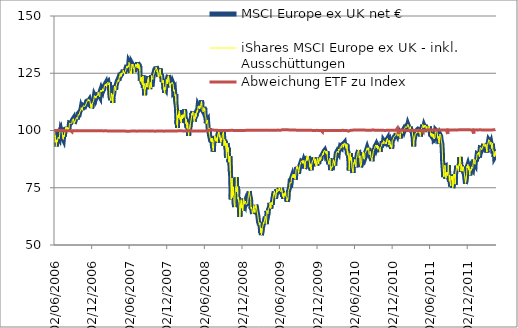
| Category | MSCI Europe ex UK net € | iShares MSCI Europe ex UK - inkl. Ausschüttungen | Abweichung ETF zu Index |
|---|---|---|---|
| 02/06/2006 | 100 | 100 | 100 |
| 05/06/2006 | 99.412 | 99.411 | 100 |
| 06/06/2006 | 97.257 | 97.28 | 100.024 |
| 07/06/2006 | 97.73 | 97.733 | 100.003 |
| 08/06/2006 | 94.902 | 94.9 | 99.998 |
| 09/06/2006 | 96.413 | 96.423 | 100.01 |
| 12/06/2006 | 95.338 | 95.353 | 100.016 |
| 13/06/2006 | 93.068 | 93.094 | 100.028 |
| 14/06/2006 | 93.34 | 93.366 | 100.028 |
| 15/06/2006 | 95.714 | 95.713 | 100 |
| 16/06/2006 | 94.985 | 95.008 | 100.025 |
| 19/06/2006 | 95.79 | 95.854 | 100.067 |
| 20/06/2006 | 96.29 | 96.294 | 100.005 |
| 21/06/2006 | 96.523 | 96.536 | 100.014 |
| 22/06/2006 | 97.085 | 97.097 | 100.013 |
| 23/06/2006 | 97.28 | 97.291 | 100.012 |
| 26/06/2006 | 97.078 | 97.096 | 100.018 |
| 27/06/2006 | 96.367 | 96.387 | 100.021 |
| 28/06/2006 | 96.334 | 96.35 | 100.017 |
| 29/06/2006 | 98.132 | 98.143 | 100.011 |
| 30/06/2006 | 99.799 | 99.799 | 99.999 |
| 03/07/2006 | 100.395 | 100.377 | 99.983 |
| 04/07/2006 | 100.609 | 100.595 | 99.987 |
| 05/07/2006 | 99.355 | 99.334 | 99.979 |
| 06/07/2006 | 100.236 | 100.241 | 100.005 |
| 07/07/2006 | 99.886 | 99.877 | 99.992 |
| 10/07/2006 | 100.283 | 100.241 | 99.958 |
| 11/07/2006 | 99.255 | 99.233 | 99.978 |
| 12/07/2006 | 99.654 | 99.637 | 99.983 |
| 13/07/2006 | 98.024 | 98.008 | 99.983 |
| 14/07/2006 | 96.695 | 96.677 | 99.981 |
| 17/07/2006 | 96.121 | 96.103 | 99.982 |
| 18/07/2006 | 95.728 | 95.667 | 99.936 |
| 19/07/2006 | 98.02 | 97.97 | 99.949 |
| 20/07/2006 | 98.397 | 98.342 | 99.944 |
| 21/07/2006 | 97.405 | 97.369 | 99.963 |
| 24/07/2006 | 99.178 | 99.121 | 99.942 |
| 25/07/2006 | 99.263 | 99.24 | 99.977 |
| 26/07/2006 | 99.585 | 99.563 | 99.977 |
| 27/07/2006 | 100.687 | 100.642 | 99.955 |
| 28/07/2006 | 101.352 | 101.29 | 99.938 |
| 31/07/2006 | 101.094 | 101.013 | 99.92 |
| 01/08/2006 | 100.239 | 100.159 | 99.921 |
| 02/08/2006 | 101.308 | 101.215 | 99.908 |
| 03/08/2006 | 100.477 | 100.392 | 99.915 |
| 04/08/2006 | 101.553 | 101.468 | 99.917 |
| 07/08/2006 | 100.264 | 100.186 | 99.923 |
| 08/08/2006 | 100.424 | 100.317 | 99.894 |
| 09/08/2006 | 101.24 | 101.13 | 99.891 |
| 10/08/2006 | 100.366 | 100.269 | 99.904 |
| 11/08/2006 | 100.446 | 100.35 | 99.904 |
| 14/08/2006 | 101.387 | 101.287 | 99.901 |
| 15/08/2006 | 102.566 | 102.463 | 99.9 |
| 16/08/2006 | 103.279 | 103.19 | 99.914 |
| 17/08/2006 | 103.645 | 103.566 | 99.924 |
| 18/08/2006 | 103.442 | 103.353 | 99.915 |
| 21/08/2006 | 103.153 | 103.072 | 99.922 |
| 22/08/2006 | 103.535 | 103.453 | 99.921 |
| 23/08/2006 | 102.957 | 102.867 | 99.912 |
| 24/08/2006 | 103.38 | 103.298 | 99.92 |
| 25/08/2006 | 103.39 | 103.298 | 99.91 |
| 28/08/2006 | 103.922 | 103.297 | 99.398 |
| 29/08/2006 | 104.126 | 104.041 | 99.919 |
| 30/08/2006 | 104.593 | 104.517 | 99.927 |
| 31/08/2006 | 104.381 | 104.284 | 99.907 |
| 01/09/2006 | 104.733 | 104.643 | 99.914 |
| 04/09/2006 | 105.283 | 105.171 | 99.894 |
| 05/09/2006 | 104.923 | 104.816 | 99.897 |
| 06/09/2006 | 103.912 | 103.822 | 99.913 |
| 07/09/2006 | 103.056 | 102.955 | 99.902 |
| 08/09/2006 | 103.472 | 103.384 | 99.914 |
| 11/09/2006 | 103.033 | 102.915 | 99.885 |
| 12/09/2006 | 104.222 | 104.119 | 99.901 |
| 13/09/2006 | 104.64 | 104.535 | 99.899 |
| 14/09/2006 | 104.542 | 104.447 | 99.909 |
| 15/09/2006 | 104.926 | 104.834 | 99.912 |
| 18/09/2006 | 105.068 | 104.971 | 99.907 |
| 19/09/2006 | 104.507 | 104.419 | 99.915 |
| 20/09/2006 | 105.777 | 105.675 | 99.904 |
| 21/09/2006 | 106.015 | 105.942 | 99.931 |
| 22/09/2006 | 104.993 | 104.929 | 99.939 |
| 25/09/2006 | 104.894 | 104.815 | 99.924 |
| 26/09/2006 | 106.225 | 106.131 | 99.911 |
| 27/09/2006 | 107.01 | 106.918 | 99.914 |
| 28/09/2006 | 107.112 | 107.006 | 99.901 |
| 29/09/2006 | 107.163 | 107.059 | 99.903 |
| 02/10/2006 | 106.947 | 106.828 | 99.889 |
| 03/10/2006 | 106.574 | 106.445 | 99.878 |
| 04/10/2006 | 107.352 | 107.218 | 99.875 |
| 05/10/2006 | 108.148 | 108.032 | 99.893 |
| 06/10/2006 | 108.169 | 108.044 | 99.885 |
| 09/10/2006 | 108.348 | 108.228 | 99.89 |
| 10/10/2006 | 109.095 | 108.997 | 99.91 |
| 11/10/2006 | 109.251 | 109.147 | 99.905 |
| 12/10/2006 | 110.095 | 109.986 | 99.901 |
| 13/10/2006 | 110.059 | 109.948 | 99.899 |
| 16/10/2006 | 110.214 | 110.113 | 99.909 |
| 17/10/2006 | 108.931 | 108.824 | 99.902 |
| 18/10/2006 | 110.002 | 109.901 | 99.909 |
| 19/10/2006 | 110.02 | 109.937 | 99.925 |
| 20/10/2006 | 110.409 | 110.312 | 99.912 |
| 23/10/2006 | 110.924 | 110.817 | 99.903 |
| 24/10/2006 | 110.817 | 110.716 | 99.909 |
| 25/10/2006 | 111.1 | 111.006 | 99.916 |
| 26/10/2006 | 111.189 | 111.092 | 99.913 |
| 27/10/2006 | 110.99 | 110.897 | 99.916 |
| 30/10/2006 | 110.563 | 110.483 | 99.928 |
| 31/10/2006 | 110.517 | 110.433 | 99.923 |
| 01/11/2006 | 110.963 | 110.882 | 99.927 |
| 02/11/2006 | 110.289 | 110.19 | 99.911 |
| 03/11/2006 | 110.801 | 110.696 | 99.905 |
| 06/11/2006 | 112.119 | 112.031 | 99.922 |
| 07/11/2006 | 112.706 | 112.602 | 99.908 |
| 08/11/2006 | 112.616 | 112.515 | 99.91 |
| 09/11/2006 | 112.674 | 112.578 | 99.914 |
| 10/11/2006 | 112.563 | 112.462 | 99.91 |
| 13/11/2006 | 113.021 | 112.933 | 99.922 |
| 14/11/2006 | 112.923 | 112.818 | 99.907 |
| 15/11/2006 | 113.683 | 113.568 | 99.898 |
| 16/11/2006 | 113.759 | 113.65 | 99.904 |
| 17/11/2006 | 112.962 | 112.848 | 99.899 |
| 20/11/2006 | 113.299 | 113.181 | 99.896 |
| 21/11/2006 | 113.515 | 113.398 | 99.898 |
| 22/11/2006 | 113.755 | 113.644 | 99.902 |
| 23/11/2006 | 113.548 | 113.441 | 99.905 |
| 24/11/2006 | 112.593 | 112.484 | 99.904 |
| 27/11/2006 | 110.677 | 110.568 | 99.902 |
| 28/11/2006 | 110.186 | 110.072 | 99.897 |
| 29/11/2006 | 111.752 | 111.652 | 99.911 |
| 30/11/2006 | 110.847 | 110.747 | 99.91 |
| 01/12/2006 | 109.749 | 109.654 | 99.913 |
| 04/12/2006 | 110.593 | 110.495 | 99.912 |
| 05/12/2006 | 111.524 | 111.427 | 99.913 |
| 06/12/2006 | 111.613 | 111.521 | 99.918 |
| 07/12/2006 | 112.273 | 112.185 | 99.921 |
| 08/12/2006 | 112.217 | 112.124 | 99.918 |
| 11/12/2006 | 113.033 | 112.944 | 99.921 |
| 12/12/2006 | 113.438 | 113.354 | 99.926 |
| 13/12/2006 | 114.062 | 113.983 | 99.931 |
| 14/12/2006 | 114.692 | 114.603 | 99.922 |
| 15/12/2006 | 115.29 | 115.216 | 99.936 |
| 18/12/2006 | 115.383 | 115.297 | 99.925 |
| 19/12/2006 | 114.551 | 114.449 | 99.911 |
| 20/12/2006 | 115.07 | 114.975 | 99.918 |
| 21/12/2006 | 115.031 | 114.936 | 99.917 |
| 22/12/2006 | 114.214 | 114.121 | 99.919 |
| 25/12/2006 | 114.214 | 114.121 | 99.919 |
| 26/12/2006 | 114.199 | 114.121 | 99.932 |
| 27/12/2006 | 115.486 | 115.379 | 99.907 |
| 28/12/2006 | 115.485 | 115.388 | 99.916 |
| 29/12/2006 | 115.401 | 115.311 | 99.922 |
| 01/01/2007 | 115.401 | 115.313 | 99.924 |
| 02/01/2007 | 116.719 | 116.631 | 99.924 |
| 03/01/2007 | 116.91 | 116.811 | 99.915 |
| 04/01/2007 | 116.436 | 116.321 | 99.901 |
| 05/01/2007 | 115.622 | 115.503 | 99.897 |
| 08/01/2007 | 115.527 | 115.397 | 99.888 |
| 09/01/2007 | 115.679 | 115.543 | 99.882 |
| 10/01/2007 | 114.837 | 114.696 | 99.877 |
| 11/01/2007 | 116.733 | 116.591 | 99.878 |
| 12/01/2007 | 117.101 | 116.945 | 99.867 |
| 15/01/2007 | 117.789 | 117.616 | 99.854 |
| 16/01/2007 | 117.379 | 117.196 | 99.844 |
| 17/01/2007 | 117.133 | 116.934 | 99.829 |
| 18/01/2007 | 116.976 | 116.765 | 99.82 |
| 19/01/2007 | 117.873 | 117.681 | 99.837 |
| 22/01/2007 | 117.352 | 117.183 | 99.855 |
| 23/01/2007 | 117.285 | 117.111 | 99.851 |
| 24/01/2007 | 118.401 | 118.217 | 99.845 |
| 25/01/2007 | 118.156 | 117.955 | 99.83 |
| 26/01/2007 | 117.401 | 117.202 | 99.831 |
| 29/01/2007 | 117.931 | 117.728 | 99.828 |
| 30/01/2007 | 118.518 | 118.326 | 99.838 |
| 31/01/2007 | 118.255 | 118.082 | 99.854 |
| 01/02/2007 | 119.216 | 119.055 | 99.865 |
| 02/02/2007 | 119.683 | 119.498 | 99.846 |
| 05/02/2007 | 119.762 | 119.576 | 99.844 |
| 06/02/2007 | 119.937 | 119.743 | 99.838 |
| 07/02/2007 | 120.496 | 120.319 | 99.853 |
| 08/02/2007 | 119.616 | 119.433 | 99.846 |
| 09/02/2007 | 120.272 | 120.094 | 99.852 |
| 12/02/2007 | 119.393 | 119.209 | 99.846 |
| 13/02/2007 | 119.806 | 119.585 | 99.816 |
| 14/02/2007 | 120.821 | 120.613 | 99.828 |
| 15/02/2007 | 120.822 | 120.598 | 99.815 |
| 16/02/2007 | 120.744 | 120.518 | 99.812 |
| 19/02/2007 | 121.293 | 121.066 | 99.812 |
| 20/02/2007 | 120.81 | 120.556 | 99.79 |
| 21/02/2007 | 120.118 | 119.867 | 99.791 |
| 22/02/2007 | 120.438 | 120.185 | 99.789 |
| 23/02/2007 | 120.636 | 120.389 | 99.796 |
| 26/02/2007 | 121.134 | 120.873 | 99.785 |
| 27/02/2007 | 117.404 | 117.15 | 99.784 |
| 28/02/2007 | 115.781 | 115.537 | 99.789 |
| 01/03/2007 | 114.611 | 114.375 | 99.793 |
| 02/03/2007 | 114.491 | 114.267 | 99.804 |
| 05/03/2007 | 113.267 | 113.036 | 99.796 |
| 06/03/2007 | 114.131 | 113.901 | 99.798 |
| 07/03/2007 | 114.911 | 114.663 | 99.784 |
| 08/03/2007 | 116.483 | 116.248 | 99.798 |
| 09/03/2007 | 116.616 | 116.373 | 99.791 |
| 12/03/2007 | 116.246 | 116.003 | 99.791 |
| 13/03/2007 | 115.057 | 114.8 | 99.777 |
| 14/03/2007 | 112.085 | 111.842 | 99.783 |
| 15/03/2007 | 114.232 | 113.99 | 99.788 |
| 16/03/2007 | 114.311 | 114.064 | 99.784 |
| 19/03/2007 | 116.107 | 115.866 | 99.792 |
| 20/03/2007 | 116.747 | 116.511 | 99.798 |
| 21/03/2007 | 117.11 | 116.87 | 99.795 |
| 22/03/2007 | 119.094 | 118.85 | 99.795 |
| 23/03/2007 | 119.648 | 119.391 | 99.785 |
| 26/03/2007 | 118.558 | 118.296 | 99.779 |
| 27/03/2007 | 118.52 | 118.264 | 99.783 |
| 28/03/2007 | 117.76 | 117.506 | 99.784 |
| 29/03/2007 | 119.168 | 118.905 | 99.779 |
| 30/03/2007 | 119.238 | 118.928 | 99.741 |
| 02/04/2007 | 119.55 | 119.285 | 99.779 |
| 03/04/2007 | 120.906 | 120.632 | 99.774 |
| 04/04/2007 | 121.221 | 120.934 | 99.764 |
| 05/04/2007 | 121.533 | 121.254 | 99.77 |
| 06/04/2007 | 121.533 | 121.254 | 99.77 |
| 09/04/2007 | 121.449 | 121.254 | 99.839 |
| 10/04/2007 | 122.424 | 122.133 | 99.762 |
| 11/04/2007 | 122.124 | 121.832 | 99.76 |
| 12/04/2007 | 121.718 | 121.411 | 99.748 |
| 13/04/2007 | 122.542 | 122.214 | 99.733 |
| 16/04/2007 | 124.083 | 123.757 | 99.737 |
| 17/04/2007 | 124.02 | 123.711 | 99.75 |
| 18/04/2007 | 123.588 | 123.283 | 99.754 |
| 19/04/2007 | 123.261 | 122.952 | 99.749 |
| 20/04/2007 | 125.084 | 124.769 | 99.749 |
| 23/04/2007 | 124.992 | 124.681 | 99.751 |
| 24/04/2007 | 124.009 | 123.698 | 99.749 |
| 25/04/2007 | 124.997 | 124.687 | 99.753 |
| 26/04/2007 | 125.467 | 125.161 | 99.756 |
| 27/04/2007 | 124.792 | 124.486 | 99.754 |
| 30/04/2007 | 124.998 | 124.691 | 99.755 |
| 01/05/2007 | 124.966 | 124.665 | 99.759 |
| 02/05/2007 | 125.621 | 125.294 | 99.74 |
| 03/05/2007 | 125.657 | 125.339 | 99.747 |
| 04/05/2007 | 126.602 | 126.258 | 99.729 |
| 07/05/2007 | 126.765 | 126.437 | 99.742 |
| 08/05/2007 | 125.49 | 125.147 | 99.727 |
| 09/05/2007 | 125.782 | 125.451 | 99.736 |
| 10/05/2007 | 124.941 | 124.599 | 99.726 |
| 11/05/2007 | 125.655 | 125.305 | 99.721 |
| 14/05/2007 | 125.523 | 125.192 | 99.736 |
| 15/05/2007 | 126.16 | 125.806 | 99.72 |
| 16/05/2007 | 125.865 | 125.557 | 99.756 |
| 17/05/2007 | 126.093 | 125.789 | 99.759 |
| 18/05/2007 | 127.381 | 127.049 | 99.739 |
| 21/05/2007 | 127.408 | 127.017 | 99.693 |
| 22/05/2007 | 127.552 | 127.212 | 99.733 |
| 23/05/2007 | 128.558 | 128.207 | 99.727 |
| 24/05/2007 | 127.606 | 127.274 | 99.74 |
| 25/05/2007 | 127.726 | 127.374 | 99.724 |
| 28/05/2007 | 128.003 | 127.639 | 99.716 |
| 29/05/2007 | 128.034 | 127.68 | 99.723 |
| 30/05/2007 | 127.735 | 127.389 | 99.729 |
| 31/05/2007 | 129.046 | 128.683 | 99.719 |
| 01/06/2007 | 130.112 | 129.753 | 99.724 |
| 04/06/2007 | 129.657 | 129.288 | 99.716 |
| 05/06/2007 | 128.93 | 128.57 | 99.72 |
| 06/06/2007 | 126.83 | 126.469 | 99.716 |
| 07/06/2007 | 125.129 | 124.791 | 99.73 |
| 08/06/2007 | 124.947 | 124.612 | 99.732 |
| 11/06/2007 | 126.07 | 125.733 | 99.732 |
| 12/06/2007 | 125.159 | 124.842 | 99.746 |
| 13/06/2007 | 125.454 | 125.121 | 99.734 |
| 14/06/2007 | 127.646 | 127.306 | 99.734 |
| 15/06/2007 | 129.291 | 128.933 | 99.723 |
| 18/06/2007 | 128.954 | 128.622 | 99.743 |
| 19/06/2007 | 128.649 | 128.317 | 99.742 |
| 20/06/2007 | 129.259 | 128.926 | 99.743 |
| 21/06/2007 | 127.754 | 127.436 | 99.751 |
| 22/06/2007 | 127.407 | 127.088 | 99.75 |
| 25/06/2007 | 127.088 | 126.769 | 99.749 |
| 26/06/2007 | 126.125 | 125.821 | 99.759 |
| 27/06/2007 | 125.505 | 125.204 | 99.76 |
| 28/06/2007 | 126.955 | 126.642 | 99.754 |
| 29/06/2007 | 127.724 | 127.393 | 99.741 |
| 02/07/2007 | 127.541 | 127.222 | 99.749 |
| 03/07/2007 | 128.586 | 128.259 | 99.746 |
| 04/07/2007 | 129.195 | 128.857 | 99.738 |
| 05/07/2007 | 128.394 | 128.057 | 99.738 |
| 06/07/2007 | 129.12 | 128.763 | 99.724 |
| 09/07/2007 | 129.511 | 129.15 | 99.721 |
| 10/07/2007 | 128.264 | 127.92 | 99.732 |
| 11/07/2007 | 127.716 | 127.381 | 99.738 |
| 12/07/2007 | 129.323 | 128.979 | 99.734 |
| 13/07/2007 | 129.805 | 129.461 | 99.735 |
| 16/07/2007 | 130.144 | 129.793 | 99.731 |
| 17/07/2007 | 129.401 | 129.05 | 99.729 |
| 18/07/2007 | 127.886 | 127.536 | 99.727 |
| 19/07/2007 | 129.155 | 128.813 | 99.735 |
| 20/07/2007 | 127.412 | 127.079 | 99.738 |
| 23/07/2007 | 128.085 | 127.765 | 99.75 |
| 24/07/2007 | 126.29 | 125.987 | 99.761 |
| 25/07/2007 | 124.925 | 124.645 | 99.775 |
| 26/07/2007 | 121.732 | 121.482 | 99.795 |
| 27/07/2007 | 121.357 | 121.113 | 99.799 |
| 30/07/2007 | 121.394 | 121.155 | 99.803 |
| 31/07/2007 | 123.567 | 123.297 | 99.781 |
| 01/08/2007 | 121.831 | 121.563 | 99.78 |
| 02/08/2007 | 122.57 | 122.288 | 99.77 |
| 03/08/2007 | 121.127 | 120.849 | 99.771 |
| 06/08/2007 | 120.203 | 119.94 | 99.781 |
| 07/08/2007 | 121.614 | 121.354 | 99.786 |
| 08/08/2007 | 124.039 | 123.761 | 99.776 |
| 09/08/2007 | 121.77 | 121.526 | 99.8 |
| 10/08/2007 | 118.569 | 118.354 | 99.819 |
| 13/08/2007 | 120.793 | 120.541 | 99.791 |
| 14/08/2007 | 119.489 | 119.236 | 99.788 |
| 15/08/2007 | 119.221 | 118.963 | 99.784 |
| 16/08/2007 | 115.395 | 115.167 | 99.803 |
| 17/08/2007 | 117.532 | 117.285 | 99.79 |
| 20/08/2007 | 118.37 | 118.111 | 99.781 |
| 21/08/2007 | 118.477 | 118.22 | 99.783 |
| 22/08/2007 | 120.286 | 119.987 | 99.751 |
| 23/08/2007 | 120.413 | 120.115 | 99.753 |
| 24/08/2007 | 120.99 | 120.684 | 99.747 |
| 27/08/2007 | 121.152 | 120.839 | 99.742 |
| 28/08/2007 | 119.218 | 118.934 | 99.762 |
| 29/08/2007 | 119.87 | 119.575 | 99.754 |
| 30/08/2007 | 121.102 | 120.795 | 99.746 |
| 31/08/2007 | 122.547 | 122.235 | 99.745 |
| 03/09/2007 | 122.812 | 122.498 | 99.744 |
| 04/09/2007 | 123.598 | 123.293 | 99.753 |
| 05/09/2007 | 121.345 | 121.038 | 99.747 |
| 06/09/2007 | 121.687 | 121.371 | 99.74 |
| 07/09/2007 | 119.093 | 118.761 | 99.721 |
| 10/09/2007 | 118.087 | 117.759 | 99.722 |
| 11/09/2007 | 119.852 | 119.536 | 99.736 |
| 12/09/2007 | 120.215 | 119.908 | 99.745 |
| 13/09/2007 | 121.314 | 120.993 | 99.736 |
| 14/09/2007 | 120.325 | 120.016 | 99.744 |
| 17/09/2007 | 119.018 | 118.73 | 99.758 |
| 18/09/2007 | 120.855 | 120.555 | 99.752 |
| 19/09/2007 | 124.249 | 123.954 | 99.762 |
| 20/09/2007 | 123.485 | 123.183 | 99.756 |
| 21/09/2007 | 123.91 | 123.619 | 99.766 |
| 24/09/2007 | 123.685 | 123.376 | 99.75 |
| 25/09/2007 | 122.609 | 122.296 | 99.745 |
| 26/09/2007 | 123.513 | 123.2 | 99.747 |
| 27/09/2007 | 124.252 | 123.945 | 99.753 |
| 28/09/2007 | 124.246 | 123.927 | 99.743 |
| 01/10/2007 | 125.249 | 124.915 | 99.734 |
| 02/10/2007 | 125.742 | 125.386 | 99.717 |
| 03/10/2007 | 125.852 | 125.482 | 99.706 |
| 04/10/2007 | 125.786 | 125.451 | 99.734 |
| 05/10/2007 | 126.778 | 126.44 | 99.733 |
| 08/10/2007 | 126.529 | 126.166 | 99.713 |
| 09/10/2007 | 127.07 | 126.699 | 99.708 |
| 10/10/2007 | 127.134 | 126.802 | 99.739 |
| 11/10/2007 | 127.954 | 127.598 | 99.722 |
| 12/10/2007 | 127.874 | 127.543 | 99.741 |
| 15/10/2007 | 126.918 | 126.59 | 99.742 |
| 16/10/2007 | 125.856 | 125.523 | 99.736 |
| 17/10/2007 | 126.472 | 126.138 | 99.736 |
| 18/10/2007 | 125.703 | 125.372 | 99.737 |
| 19/10/2007 | 125.12 | 124.806 | 99.749 |
| 22/10/2007 | 123.446 | 123.138 | 99.75 |
| 23/10/2007 | 124.546 | 124.252 | 99.764 |
| 24/10/2007 | 123.81 | 123.522 | 99.767 |
| 25/10/2007 | 125.274 | 124.98 | 99.766 |
| 26/10/2007 | 125.926 | 125.634 | 99.768 |
| 29/10/2007 | 126.661 | 126.378 | 99.777 |
| 30/10/2007 | 126.093 | 125.815 | 99.78 |
| 31/10/2007 | 127.03 | 126.74 | 99.772 |
| 01/11/2007 | 125.158 | 124.86 | 99.762 |
| 02/11/2007 | 124.549 | 124.257 | 99.765 |
| 05/11/2007 | 123.931 | 123.655 | 99.777 |
| 06/11/2007 | 124.573 | 124.292 | 99.775 |
| 07/11/2007 | 124.03 | 123.734 | 99.762 |
| 08/11/2007 | 123.11 | 122.819 | 99.764 |
| 09/11/2007 | 121.234 | 120.932 | 99.751 |
| 12/11/2007 | 121.373 | 121.054 | 99.737 |
| 13/11/2007 | 121.415 | 121.059 | 99.706 |
| 14/11/2007 | 122.277 | 121.927 | 99.714 |
| 15/11/2007 | 121.012 | 120.672 | 99.719 |
| 16/11/2007 | 120.217 | 119.88 | 99.72 |
| 19/11/2007 | 117.902 | 117.569 | 99.718 |
| 20/11/2007 | 119.075 | 118.76 | 99.735 |
| 21/11/2007 | 116.386 | 116.073 | 99.731 |
| 22/11/2007 | 116.875 | 116.575 | 99.744 |
| 23/11/2007 | 118.628 | 118.318 | 99.738 |
| 26/11/2007 | 118.183 | 117.88 | 99.743 |
| 27/11/2007 | 117.784 | 117.476 | 99.738 |
| 28/11/2007 | 120.562 | 120.249 | 99.741 |
| 29/11/2007 | 121.227 | 120.905 | 99.734 |
| 30/11/2007 | 122.545 | 122.237 | 99.749 |
| 03/12/2007 | 121.858 | 121.55 | 99.747 |
| 04/12/2007 | 120.614 | 120.314 | 99.751 |
| 05/12/2007 | 122.599 | 122.291 | 99.749 |
| 06/12/2007 | 122.711 | 122.403 | 99.749 |
| 07/12/2007 | 123.525 | 123.217 | 99.75 |
| 10/12/2007 | 124.218 | 123.896 | 99.741 |
| 11/12/2007 | 123.867 | 123.543 | 99.738 |
| 12/12/2007 | 124.066 | 123.743 | 99.739 |
| 13/12/2007 | 121.321 | 121.011 | 99.744 |
| 14/12/2007 | 121.693 | 121.377 | 99.74 |
| 17/12/2007 | 119.575 | 119.277 | 99.751 |
| 18/12/2007 | 119.339 | 119.042 | 99.751 |
| 19/12/2007 | 118.873 | 118.583 | 99.756 |
| 20/12/2007 | 119.158 | 118.867 | 99.756 |
| 21/12/2007 | 120.827 | 120.533 | 99.757 |
| 24/12/2007 | 120.907 | 120.608 | 99.752 |
| 25/12/2007 | 120.907 | 120.608 | 99.752 |
| 26/12/2007 | 120.929 | 120.608 | 99.734 |
| 27/12/2007 | 121.218 | 120.919 | 99.754 |
| 28/12/2007 | 121.409 | 121.105 | 99.749 |
| 31/12/2007 | 121.421 | 121.115 | 99.748 |
| 01/01/2008 | 121.421 | 121.115 | 99.748 |
| 02/01/2008 | 120.28 | 119.965 | 99.738 |
| 03/01/2008 | 119.587 | 119.281 | 99.744 |
| 04/01/2008 | 117.482 | 117.181 | 99.744 |
| 07/01/2008 | 117.196 | 116.898 | 99.745 |
| 08/01/2008 | 118.075 | 117.776 | 99.747 |
| 09/01/2008 | 116.818 | 116.536 | 99.759 |
| 10/01/2008 | 115.875 | 115.608 | 99.77 |
| 11/01/2008 | 115.29 | 115.037 | 99.781 |
| 14/01/2008 | 115.959 | 115.704 | 99.781 |
| 15/01/2008 | 112.822 | 112.597 | 99.801 |
| 16/01/2008 | 111.538 | 111.315 | 99.8 |
| 17/01/2008 | 110.731 | 110.508 | 99.799 |
| 18/01/2008 | 109.358 | 109.155 | 99.814 |
| 21/01/2008 | 102.729 | 102.544 | 99.82 |
| 22/01/2008 | 104.593 | 104.42 | 99.835 |
| 23/01/2008 | 101.073 | 100.92 | 99.848 |
| 24/01/2008 | 106.68 | 106.526 | 99.855 |
| 25/01/2008 | 106.562 | 106.403 | 99.851 |
| 28/01/2008 | 105.729 | 105.578 | 99.857 |
| 29/01/2008 | 107.415 | 107.251 | 99.848 |
| 30/01/2008 | 106.785 | 106.622 | 99.847 |
| 31/01/2008 | 106.549 | 106.381 | 99.842 |
| 01/02/2008 | 108.78 | 108.618 | 99.851 |
| 04/02/2008 | 108.9 | 108.726 | 99.84 |
| 05/02/2008 | 104.992 | 104.824 | 99.839 |
| 06/02/2008 | 105.925 | 105.751 | 99.836 |
| 07/02/2008 | 104.116 | 103.947 | 99.838 |
| 08/02/2008 | 104.193 | 104.029 | 99.843 |
| 11/02/2008 | 103.402 | 103.241 | 99.845 |
| 12/02/2008 | 106.761 | 106.579 | 99.83 |
| 13/02/2008 | 106.97 | 106.784 | 99.827 |
| 14/02/2008 | 107.064 | 106.877 | 99.826 |
| 15/02/2008 | 105.215 | 105.041 | 99.835 |
| 18/02/2008 | 107.048 | 106.863 | 99.827 |
| 19/02/2008 | 107.462 | 107.271 | 99.822 |
| 20/02/2008 | 106.179 | 105.987 | 99.819 |
| 21/02/2008 | 106.865 | 106.654 | 99.803 |
| 22/02/2008 | 105.948 | 105.73 | 99.794 |
| 25/02/2008 | 107.636 | 107.417 | 99.796 |
| 26/02/2008 | 109.221 | 108.998 | 99.796 |
| 27/02/2008 | 109.318 | 109.101 | 99.801 |
| 28/02/2008 | 107.569 | 107.354 | 99.8 |
| 29/02/2008 | 106.175 | 106.012 | 99.846 |
| 03/03/2008 | 104.767 | 104.621 | 99.86 |
| 04/03/2008 | 103.124 | 102.981 | 99.862 |
| 05/03/2008 | 105.019 | 104.867 | 99.855 |
| 06/03/2008 | 103.517 | 103.38 | 99.867 |
| 07/03/2008 | 102.284 | 102.145 | 99.864 |
| 10/03/2008 | 101.068 | 100.933 | 99.866 |
| 11/03/2008 | 102.431 | 102.3 | 99.872 |
| 12/03/2008 | 103.563 | 103.438 | 99.88 |
| 13/03/2008 | 102.368 | 102.245 | 99.88 |
| 14/03/2008 | 101.504 | 101.384 | 99.882 |
| 17/03/2008 | 97.666 | 97.556 | 99.888 |
| 18/03/2008 | 100.747 | 100.641 | 99.894 |
| 19/03/2008 | 100.126 | 100.027 | 99.901 |
| 20/03/2008 | 99.565 | 99.462 | 99.897 |
| 21/03/2008 | 99.565 | 99.462 | 99.897 |
| 24/03/2008 | 99.41 | 99.462 | 100.053 |
| 25/03/2008 | 102.804 | 102.691 | 99.89 |
| 26/03/2008 | 102.512 | 102.393 | 99.884 |
| 27/03/2008 | 103.738 | 103.596 | 99.863 |
| 28/03/2008 | 103.48 | 103.339 | 99.864 |
| 31/03/2008 | 103.35 | 103.192 | 99.847 |
| 01/04/2008 | 106.492 | 106.309 | 99.829 |
| 02/04/2008 | 107.652 | 107.444 | 99.807 |
| 03/04/2008 | 106.903 | 106.696 | 99.806 |
| 04/04/2008 | 107.45 | 107.239 | 99.803 |
| 07/04/2008 | 108.397 | 108.181 | 99.801 |
| 08/04/2008 | 107.611 | 107.393 | 99.798 |
| 09/04/2008 | 106.692 | 106.473 | 99.795 |
| 10/04/2008 | 106.245 | 106.033 | 99.801 |
| 11/04/2008 | 104.882 | 104.676 | 99.804 |
| 14/04/2008 | 103.988 | 103.791 | 99.811 |
| 15/04/2008 | 104.492 | 104.285 | 99.802 |
| 16/04/2008 | 106.213 | 106.003 | 99.802 |
| 17/04/2008 | 105.432 | 105.233 | 99.811 |
| 18/04/2008 | 107.674 | 107.456 | 99.798 |
| 21/04/2008 | 106.932 | 106.703 | 99.785 |
| 22/04/2008 | 106.261 | 106.039 | 99.791 |
| 23/04/2008 | 106.957 | 106.728 | 99.786 |
| 24/04/2008 | 107.079 | 106.848 | 99.784 |
| 25/04/2008 | 108.289 | 108.048 | 99.777 |
| 28/04/2008 | 109.042 | 108.782 | 99.762 |
| 29/04/2008 | 108.228 | 107.974 | 99.765 |
| 30/04/2008 | 109.036 | 108.778 | 99.764 |
| 01/05/2008 | 109.043 | 108.785 | 99.763 |
| 02/05/2008 | 110.743 | 110.494 | 99.775 |
| 05/05/2008 | 110.676 | 110.425 | 99.773 |
| 06/05/2008 | 109.967 | 109.73 | 99.785 |
| 07/05/2008 | 111.046 | 110.784 | 99.764 |
| 08/05/2008 | 110.816 | 110.553 | 99.763 |
| 09/05/2008 | 109.67 | 109.421 | 99.773 |
| 12/05/2008 | 109.945 | 109.701 | 99.779 |
| 13/05/2008 | 110.217 | 109.964 | 99.771 |
| 14/05/2008 | 111.074 | 110.811 | 99.763 |
| 15/05/2008 | 111.373 | 111.102 | 99.757 |
| 16/05/2008 | 111.921 | 111.647 | 99.755 |
| 19/05/2008 | 113.128 | 112.822 | 99.73 |
| 20/05/2008 | 111.231 | 110.923 | 99.723 |
| 21/05/2008 | 110.483 | 110.212 | 99.755 |
| 22/05/2008 | 110.705 | 110.43 | 99.752 |
| 23/05/2008 | 108.965 | 108.718 | 99.773 |
| 26/05/2008 | 108.635 | 108.39 | 99.774 |
| 27/05/2008 | 108.339 | 108.092 | 99.772 |
| 28/05/2008 | 109.277 | 109.034 | 99.778 |
| 29/05/2008 | 109.549 | 109.295 | 99.768 |
| 30/05/2008 | 110.24 | 109.979 | 99.763 |
| 02/06/2008 | 109.089 | 108.87 | 99.799 |
| 03/06/2008 | 109.692 | 109.468 | 99.796 |
| 04/06/2008 | 108.642 | 108.423 | 99.799 |
| 05/06/2008 | 108.488 | 108.301 | 99.828 |
| 06/06/2008 | 106.367 | 106.204 | 99.847 |
| 09/06/2008 | 105.738 | 105.594 | 99.864 |
| 10/06/2008 | 104.916 | 104.778 | 99.869 |
| 11/06/2008 | 103.143 | 103.03 | 99.89 |
| 12/06/2008 | 103.937 | 103.816 | 99.884 |
| 13/06/2008 | 104.364 | 104.238 | 99.88 |
| 16/06/2008 | 103.991 | 103.904 | 99.917 |
| 17/06/2008 | 104.555 | 104.612 | 100.054 |
| 18/06/2008 | 103.064 | 103.134 | 100.068 |
| 19/06/2008 | 102.355 | 102.443 | 100.086 |
| 20/06/2008 | 100.78 | 100.888 | 100.107 |
| 23/06/2008 | 100.321 | 100.449 | 100.127 |
| 24/06/2008 | 99.551 | 99.692 | 100.141 |
| 25/06/2008 | 100.97 | 101.098 | 100.126 |
| 26/06/2008 | 98.472 | 98.633 | 100.164 |
| 27/06/2008 | 97.739 | 97.911 | 100.176 |
| 30/06/2008 | 98.079 | 98.261 | 100.186 |
| 01/07/2008 | 96.141 | 96.346 | 100.213 |
| 02/07/2008 | 95.775 | 95.992 | 100.227 |
| 03/07/2008 | 96.337 | 96.549 | 100.22 |
| 04/07/2008 | 95.069 | 95.296 | 100.238 |
| 07/07/2008 | 96.309 | 96.524 | 100.223 |
| 08/07/2008 | 94.823 | 95.052 | 100.241 |
| 09/07/2008 | 96.486 | 96.692 | 100.214 |
| 10/07/2008 | 94.699 | 94.924 | 100.238 |
| 11/07/2008 | 92.253 | 92.508 | 100.276 |
| 14/07/2008 | 92.814 | 93.062 | 100.267 |
| 15/07/2008 | 90.831 | 91.095 | 100.291 |
| 16/07/2008 | 91.642 | 91.9 | 100.282 |
| 17/07/2008 | 94.2 | 94.29 | 100.096 |
| 18/07/2008 | 95.708 | 95.778 | 100.073 |
| 21/07/2008 | 96.334 | 96.395 | 100.063 |
| 22/07/2008 | 95.95 | 96.006 | 100.058 |
| 23/07/2008 | 97.64 | 97.684 | 100.045 |
| 24/07/2008 | 96.365 | 96.424 | 100.061 |
| 25/07/2008 | 96.174 | 96.242 | 100.07 |
| 28/07/2008 | 95.218 | 95.295 | 100.081 |
| 29/07/2008 | 95.451 | 95.532 | 100.085 |
| 30/07/2008 | 96.733 | 96.796 | 100.065 |
| 31/07/2008 | 96.765 | 96.816 | 100.053 |
| 01/08/2008 | 95.497 | 95.558 | 100.064 |
| 04/08/2008 | 94.762 | 94.839 | 100.08 |
| 05/08/2008 | 97.116 | 97.149 | 100.035 |
| 06/08/2008 | 98.096 | 98.137 | 100.041 |
| 07/08/2008 | 97.787 | 97.828 | 100.042 |
| 08/08/2008 | 98.457 | 98.489 | 100.032 |
| 11/08/2008 | 99.737 | 99.755 | 100.018 |
| 12/08/2008 | 99.385 | 99.419 | 100.034 |
| 13/08/2008 | 97.225 | 97.275 | 100.051 |
| 14/08/2008 | 97.471 | 97.517 | 100.047 |
| 15/08/2008 | 98.033 | 98.054 | 100.021 |
| 18/08/2008 | 97.968 | 97.986 | 100.019 |
| 19/08/2008 | 95.568 | 95.612 | 100.046 |
| 20/08/2008 | 95.847 | 95.885 | 100.04 |
| 21/08/2008 | 94.766 | 94.834 | 100.072 |
| 22/08/2008 | 96.543 | 96.576 | 100.034 |
| 25/08/2008 | 95.771 | 95.817 | 100.048 |
| 26/08/2008 | 96.247 | 96.289 | 100.044 |
| 27/08/2008 | 96.277 | 96.289 | 100.013 |
| 28/08/2008 | 97.851 | 97.874 | 100.024 |
| 29/08/2008 | 98.175 | 98.193 | 100.018 |
| 01/09/2008 | 98.105 | 98.131 | 100.027 |
| 02/09/2008 | 99.398 | 99.428 | 100.03 |
| 03/09/2008 | 98.206 | 98.24 | 100.035 |
| 04/09/2008 | 95.488 | 95.513 | 100.026 |
| 05/09/2008 | 93.293 | 93.309 | 100.017 |
| 08/09/2008 | 95.993 | 96.013 | 100.021 |
| 09/09/2008 | 95.184 | 95.203 | 100.019 |
| 10/09/2008 | 94.52 | 94.534 | 100.015 |
| 11/09/2008 | 93.832 | 93.848 | 100.017 |
| 12/09/2008 | 95.33 | 95.346 | 100.016 |
| 15/09/2008 | 92.065 | 92.085 | 100.022 |
| 16/09/2008 | 90.186 | 90.218 | 100.035 |
| 17/09/2008 | 88.14 | 88.178 | 100.044 |
| 18/09/2008 | 87.705 | 87.74 | 100.04 |
| 19/09/2008 | 94.445 | 94.469 | 100.025 |
| 22/09/2008 | 92.704 | 92.739 | 100.037 |
| 23/09/2008 | 91.139 | 91.172 | 100.035 |
| 24/09/2008 | 90.547 | 90.591 | 100.048 |
| 25/09/2008 | 92.527 | 92.573 | 100.049 |
| 26/09/2008 | 90.801 | 90.846 | 100.049 |
| 29/09/2008 | 86.116 | 86.164 | 100.056 |
| 30/09/2008 | 87.265 | 87.315 | 100.058 |
| 01/10/2008 | 87.777 | 87.819 | 100.048 |
| 02/10/2008 | 86.375 | 86.413 | 100.043 |
| 03/10/2008 | 88.756 | 88.795 | 100.044 |
| 06/10/2008 | 82.097 | 82.137 | 100.049 |
| 07/10/2008 | 81.456 | 81.488 | 100.038 |
| 08/10/2008 | 76.795 | 76.85 | 100.071 |
| 09/10/2008 | 75.102 | 75.162 | 100.079 |
| 10/10/2008 | 69.914 | 69.976 | 100.088 |
| 13/10/2008 | 76.962 | 77.033 | 100.092 |
| 14/10/2008 | 79.208 | 79.245 | 100.046 |
| 15/10/2008 | 74.331 | 74.365 | 100.046 |
| 16/10/2008 | 70.781 | 70.81 | 100.042 |
| 17/10/2008 | 73.303 | 73.34 | 100.05 |
| 20/10/2008 | 75.381 | 75.412 | 100.041 |
| 21/10/2008 | 75.214 | 75.233 | 100.026 |
| 22/10/2008 | 71.589 | 71.637 | 100.066 |
| 23/10/2008 | 71.115 | 71.156 | 100.058 |
| 24/10/2008 | 68.196 | 68.235 | 100.057 |
| 27/10/2008 | 66.576 | 66.605 | 100.043 |
| 28/10/2008 | 68.126 | 68.137 | 100.016 |
| 29/10/2008 | 72.287 | 72.29 | 100.005 |
| 30/10/2008 | 73.084 | 73.095 | 100.015 |
| 31/10/2008 | 75.099 | 75.07 | 99.961 |
| 03/11/2008 | 76.011 | 75.998 | 99.983 |
| 04/11/2008 | 79.567 | 79.541 | 99.968 |
| 05/11/2008 | 77.744 | 77.726 | 99.977 |
| 06/11/2008 | 73.282 | 73.265 | 99.977 |
| 07/11/2008 | 74.722 | 74.705 | 99.977 |
| 10/11/2008 | 75.481 | 75.46 | 99.972 |
| 11/11/2008 | 72.199 | 72.186 | 99.982 |
| 12/11/2008 | 70.03 | 70.017 | 99.981 |
| 13/11/2008 | 70.243 | 70.235 | 99.989 |
| 14/11/2008 | 70.871 | 70.875 | 100.004 |
| 17/11/2008 | 68.568 | 68.568 | 100 |
| 18/11/2008 | 68.819 | 68.817 | 99.997 |
| 19/11/2008 | 66.098 | 66.092 | 99.991 |
| 20/11/2008 | 63.901 | 63.905 | 100.005 |
| 21/11/2008 | 62.255 | 62.256 | 100.003 |
| 24/11/2008 | 67.43 | 67.423 | 99.989 |
| 25/11/2008 | 67.829 | 67.838 | 100.013 |
| 26/11/2008 | 67.552 | 67.556 | 100.007 |
| 27/11/2008 | 69.261 | 69.267 | 100.009 |
| 28/11/2008 | 69.754 | 69.754 | 100 |
| 01/12/2008 | 66.096 | 66.115 | 100.029 |
| 02/12/2008 | 67.451 | 67.452 | 100.002 |
| 03/12/2008 | 67.81 | 67.823 | 100.019 |
| 04/12/2008 | 67.818 | 67.833 | 100.021 |
| 05/12/2008 | 64.86 | 64.877 | 100.026 |
| 08/12/2008 | 69.463 | 69.479 | 100.023 |
| 09/12/2008 | 70.264 | 70.277 | 100.019 |
| 10/12/2008 | 70.507 | 70.512 | 100.008 |
| 11/12/2008 | 69.975 | 69.99 | 100.023 |
| 12/12/2008 | 68.329 | 68.339 | 100.014 |
| 15/12/2008 | 67.783 | 67.798 | 100.022 |
| 16/12/2008 | 68.648 | 68.677 | 100.043 |
| 17/12/2008 | 68.807 | 68.842 | 100.052 |
| 18/12/2008 | 69.132 | 69.185 | 100.076 |
| 19/12/2008 | 68.646 | 68.688 | 100.061 |
| 22/12/2008 | 67.68 | 67.737 | 100.085 |
| 23/12/2008 | 67.589 | 67.652 | 100.094 |
| 24/12/2008 | 67.506 | 67.565 | 100.087 |
| 25/12/2008 | 67.506 | 67.565 | 100.087 |
| 26/12/2008 | 67.489 | 67.565 | 100.112 |
| 29/12/2008 | 68.201 | 68.254 | 100.077 |
| 30/12/2008 | 69.492 | 69.55 | 100.083 |
| 31/12/2008 | 69.546 | 69.607 | 100.088 |
| 01/01/2009 | 69.546 | 69.607 | 100.088 |
| 02/01/2009 | 71.611 | 71.666 | 100.078 |
| 05/01/2009 | 72.731 | 72.784 | 100.072 |
| 06/01/2009 | 73.526 | 73.569 | 100.058 |
| 07/01/2009 | 72.73 | 72.764 | 100.048 |
| 08/01/2009 | 72.123 | 72.164 | 100.057 |
| 09/01/2009 | 71.426 | 71.475 | 100.069 |
| 12/01/2009 | 70.367 | 70.422 | 100.078 |
| 13/01/2009 | 69.359 | 69.424 | 100.093 |
| 14/01/2009 | 66.494 | 66.561 | 100.102 |
| 15/01/2009 | 65.849 | 65.92 | 100.107 |
| 16/01/2009 | 66.455 | 66.518 | 100.095 |
| 19/01/2009 | 65.531 | 65.583 | 100.08 |
| 20/01/2009 | 64.306 | 64.355 | 100.077 |
| 21/01/2009 | 64.285 | 64.344 | 100.093 |
| 22/01/2009 | 63.609 | 63.668 | 100.092 |
| 23/01/2009 | 63.299 | 63.361 | 100.097 |
| 26/01/2009 | 65.229 | 65.287 | 100.089 |
| 27/01/2009 | 65.071 | 65.123 | 100.08 |
| 28/01/2009 | 67.184 | 67.244 | 100.089 |
| 29/01/2009 | 65.857 | 65.914 | 100.088 |
| 30/01/2009 | 65.512 | 65.569 | 100.087 |
| 02/02/2009 | 64.129 | 64.197 | 100.106 |
| 03/02/2009 | 65.235 | 65.288 | 100.081 |
| 04/02/2009 | 66.559 | 66.612 | 100.079 |
| 05/02/2009 | 66.128 | 66.173 | 100.067 |
| 06/02/2009 | 67.503 | 67.551 | 100.07 |
| 09/02/2009 | 67.92 | 67.964 | 100.064 |
| 10/02/2009 | 66.239 | 66.287 | 100.072 |
| 11/02/2009 | 66.172 | 66.21 | 100.057 |
| 12/02/2009 | 65.088 | 65.127 | 100.059 |
| 13/02/2009 | 65.467 | 65.507 | 100.06 |
| 16/02/2009 | 64.691 | 64.734 | 100.066 |
| 17/02/2009 | 62.562 | 62.613 | 100.081 |
| 18/02/2009 | 62.478 | 62.526 | 100.077 |
| 19/02/2009 | 62.559 | 62.607 | 100.077 |
| 20/02/2009 | 60.085 | 60.145 | 100.101 |
| 23/02/2009 | 59.316 | 59.373 | 100.096 |
| 24/02/2009 | 58.654 | 58.725 | 100.122 |
| 25/02/2009 | 58.362 | 58.43 | 100.117 |
| 26/02/2009 | 59.633 | 59.708 | 100.126 |
| 27/02/2009 | 58.78 | 58.86 | 100.136 |
| 02/03/2009 | 56.137 | 56.214 | 100.137 |
| 03/03/2009 | 55.28 | 55.352 | 100.13 |
| 04/03/2009 | 57.322 | 57.399 | 100.134 |
| 05/03/2009 | 55.113 | 55.185 | 100.13 |
| 06/03/2009 | 54.307 | 54.381 | 100.135 |
| 09/03/2009 | 54.165 | 54.243 | 100.145 |
| 10/03/2009 | 57.061 | 57.142 | 100.143 |
| 11/03/2009 | 57.531 | 57.617 | 100.15 |
| 12/03/2009 | 57.935 | 58.03 | 100.164 |
| 13/03/2009 | 58.117 | 58.209 | 100.158 |
| 16/03/2009 | 59.675 | 59.756 | 100.137 |
| 17/03/2009 | 59.231 | 59.313 | 100.138 |
| 18/03/2009 | 59.278 | 59.362 | 100.141 |
| 19/03/2009 | 59.792 | 59.883 | 100.154 |
| 20/03/2009 | 59.916 | 60.002 | 100.143 |
| 23/03/2009 | 61.641 | 61.723 | 100.133 |
| 24/03/2009 | 61.627 | 61.707 | 100.13 |
| 25/03/2009 | 62.378 | 62.457 | 100.127 |
| 26/03/2009 | 62.584 | 62.674 | 100.144 |
| 27/03/2009 | 61.624 | 61.717 | 100.152 |
| 30/03/2009 | 59.136 | 59.235 | 100.167 |
| 31/03/2009 | 60.986 | 61.08 | 100.155 |
| 01/04/2009 | 61.941 | 62.021 | 100.129 |
| 02/04/2009 | 64.966 | 65.039 | 100.113 |
| 03/04/2009 | 64.38 | 64.453 | 100.114 |
| 06/04/2009 | 64.021 | 64.091 | 100.11 |
| 07/04/2009 | 63.536 | 63.621 | 100.134 |
| 08/04/2009 | 63.976 | 64.067 | 100.141 |
| 09/04/2009 | 65.466 | 65.556 | 100.137 |
| 10/04/2009 | 65.469 | 65.556 | 100.132 |
| 13/04/2009 | 65.508 | 65.556 | 100.073 |
| 14/04/2009 | 66.495 | 66.574 | 100.118 |
| 15/04/2009 | 66.078 | 66.142 | 100.097 |
| 16/04/2009 | 67.321 | 67.355 | 100.051 |
| 17/04/2009 | 68.431 | 68.479 | 100.071 |
| 20/04/2009 | 65.988 | 66.027 | 100.059 |
| 21/04/2009 | 66.11 | 66.192 | 100.123 |
| 22/04/2009 | 67.202 | 67.268 | 100.099 |
| 23/04/2009 | 66.926 | 66.989 | 100.093 |
| 24/04/2009 | 68.494 | 68.577 | 100.121 |
| 27/04/2009 | 68.619 | 68.7 | 100.118 |
| 28/04/2009 | 67.551 | 67.645 | 100.14 |
| 29/04/2009 | 69.044 | 69.126 | 100.12 |
| 30/04/2009 | 70.003 | 70.082 | 100.113 |
| 01/05/2009 | 70.041 | 70.165 | 100.176 |
| 04/05/2009 | 71.823 | 71.892 | 100.096 |
| 05/05/2009 | 71.559 | 71.639 | 100.112 |
| 06/05/2009 | 72.544 | 72.612 | 100.094 |
| 07/05/2009 | 72.065 | 72.143 | 100.108 |
| 08/05/2009 | 73.427 | 73.491 | 100.087 |
| 11/05/2009 | 72.394 | 72.467 | 100.101 |
| 12/05/2009 | 72.086 | 72.162 | 100.105 |
| 13/05/2009 | 70.287 | 70.389 | 100.144 |
| 14/05/2009 | 70.516 | 70.623 | 100.153 |
| 15/05/2009 | 70.973 | 71.073 | 100.141 |
| 18/05/2009 | 72.515 | 72.587 | 100.1 |
| 19/05/2009 | 73.622 | 73.737 | 100.156 |
| 20/05/2009 | 74.332 | 74.438 | 100.143 |
| 21/05/2009 | 72.97 | 73.104 | 100.183 |
| 22/05/2009 | 72.733 | 72.866 | 100.184 |
| 25/05/2009 | 72.918 | 73.046 | 100.176 |
| 26/05/2009 | 73.296 | 73.409 | 100.155 |
| 27/05/2009 | 73.671 | 73.784 | 100.154 |
| 28/05/2009 | 72.878 | 72.996 | 100.161 |
| 29/05/2009 | 72.962 | 73.08 | 100.161 |
| 01/06/2009 | 74.796 | 74.908 | 100.15 |
| 02/06/2009 | 75.067 | 75.177 | 100.148 |
| 03/06/2009 | 73.635 | 73.749 | 100.154 |
| 04/06/2009 | 73.752 | 73.858 | 100.144 |
| 05/06/2009 | 73.991 | 74.092 | 100.137 |
| 08/06/2009 | 73.199 | 73.309 | 100.151 |
| 09/06/2009 | 73.45 | 73.565 | 100.155 |
| 10/06/2009 | 74.31 | 74.418 | 100.145 |
| 11/06/2009 | 74.926 | 75.031 | 100.141 |
| 12/06/2009 | 74.747 | 74.952 | 100.275 |
| 15/06/2009 | 72.739 | 72.952 | 100.292 |
| 16/06/2009 | 72.528 | 72.745 | 100.299 |
| 17/06/2009 | 71.074 | 71.287 | 100.3 |
| 18/06/2009 | 71.714 | 71.946 | 100.323 |
| 19/06/2009 | 72.307 | 72.537 | 100.318 |
| 22/06/2009 | 70.22 | 70.445 | 100.32 |
| 23/06/2009 | 70.226 | 70.449 | 100.317 |
| 24/06/2009 | 71.954 | 72.179 | 100.312 |
| 25/06/2009 | 71.396 | 71.624 | 100.32 |
| 26/06/2009 | 71.296 | 71.522 | 100.316 |
| 29/06/2009 | 72.638 | 72.856 | 100.301 |
| 30/06/2009 | 71.949 | 72.171 | 100.309 |
| 01/07/2009 | 73.363 | 73.581 | 100.296 |
| 02/07/2009 | 71.396 | 71.625 | 100.321 |
| 03/07/2009 | 71.371 | 71.599 | 100.318 |
| 06/07/2009 | 70.588 | 70.815 | 100.321 |
| 07/07/2009 | 70.085 | 70.31 | 100.32 |
| 08/07/2009 | 69.304 | 69.531 | 100.328 |
| 09/07/2009 | 69.785 | 70.005 | 100.315 |
| 10/07/2009 | 68.922 | 69.149 | 100.328 |
| 13/07/2009 | 70.367 | 70.582 | 100.305 |
| 14/07/2009 | 71.097 | 71.302 | 100.29 |
| 15/07/2009 | 73.148 | 73.343 | 100.267 |
| 16/07/2009 | 73.493 | 73.685 | 100.262 |
| 17/07/2009 | 73.93 | 74.118 | 100.255 |
| 20/07/2009 | 74.708 | 74.889 | 100.241 |
| 21/07/2009 | 75.403 | 75.584 | 100.24 |
| 22/07/2009 | 75.627 | 75.81 | 100.242 |
| 23/07/2009 | 77.159 | 77.332 | 100.225 |
| 24/07/2009 | 77.101 | 77.276 | 100.227 |
| 27/07/2009 | 77.429 | 77.6 | 100.222 |
| 28/07/2009 | 76.8 | 76.977 | 100.23 |
| 29/07/2009 | 77.436 | 77.605 | 100.218 |
| 30/07/2009 | 79.071 | 79.232 | 100.203 |
| 31/07/2009 | 79.083 | 79.238 | 100.196 |
| 03/08/2009 | 80.157 | 80.305 | 100.184 |
| 04/08/2009 | 79.88 | 80.027 | 100.184 |
| 05/08/2009 | 79.328 | 79.477 | 100.187 |
| 06/08/2009 | 79.771 | 79.917 | 100.182 |
| 07/08/2009 | 80.763 | 80.901 | 100.171 |
| 10/08/2009 | 80.426 | 80.563 | 100.17 |
| 11/08/2009 | 79.225 | 79.37 | 100.183 |
| 12/08/2009 | 80.173 | 80.309 | 100.169 |
| 13/08/2009 | 80.82 | 80.955 | 100.168 |
| 14/08/2009 | 80.184 | 80.323 | 100.174 |
| 17/08/2009 | 78.516 | 78.668 | 100.194 |
| 18/08/2009 | 79.329 | 79.476 | 100.185 |
| 19/08/2009 | 79.314 | 79.463 | 100.188 |
| 20/08/2009 | 80.479 | 80.62 | 100.175 |
| 21/08/2009 | 82.591 | 82.719 | 100.154 |
| 24/08/2009 | 83.477 | 83.595 | 100.141 |
| 25/08/2009 | 83.949 | 84.068 | 100.142 |
| 26/08/2009 | 83.579 | 83.693 | 100.137 |
| 27/08/2009 | 83.204 | 83.314 | 100.132 |
| 28/08/2009 | 84.122 | 84.234 | 100.134 |
| 31/08/2009 | 83.345 | 83.454 | 100.13 |
| 01/09/2009 | 81.866 | 81.972 | 100.129 |
| 02/09/2009 | 81.158 | 81.263 | 100.13 |
| 03/09/2009 | 81.16 | 81.267 | 100.132 |
| 04/09/2009 | 82.234 | 82.343 | 100.132 |
| 07/09/2009 | 83.495 | 83.595 | 100.12 |
| 08/09/2009 | 83.784 | 83.88 | 100.114 |
| 09/09/2009 | 84.654 | 84.753 | 100.117 |
| 10/09/2009 | 84.643 | 84.739 | 100.114 |
| 11/09/2009 | 85.132 | 85.227 | 100.111 |
| 14/09/2009 | 84.969 | 85.062 | 100.108 |
| 15/09/2009 | 85.336 | 85.428 | 100.108 |
| 16/09/2009 | 86.535 | 86.624 | 100.103 |
| 17/09/2009 | 86.935 | 87.023 | 100.102 |
| 18/09/2009 | 86.834 | 86.919 | 100.099 |
| 21/09/2009 | 86.244 | 86.322 | 100.091 |
| 22/09/2009 | 86.743 | 86.82 | 100.089 |
| 23/09/2009 | 86.864 | 86.943 | 100.091 |
| 24/09/2009 | 85.551 | 85.625 | 100.087 |
| 25/09/2009 | 85.256 | 85.339 | 100.097 |
| 28/09/2009 | 86.83 | 86.898 | 100.078 |
| 29/09/2009 | 86.68 | 86.762 | 100.094 |
| 30/09/2009 | 86.33 | 86.407 | 100.09 |
| 01/10/2009 | 84.839 | 84.912 | 100.085 |
| 02/10/2009 | 83.331 | 83.399 | 100.082 |
| 05/10/2009 | 84.021 | 84.088 | 100.08 |
| 06/10/2009 | 86.136 | 86.208 | 100.084 |
| 07/10/2009 | 85.754 | 85.829 | 100.087 |
| 08/10/2009 | 86.776 | 86.841 | 100.075 |
| 09/10/2009 | 86.739 | 86.8 | 100.07 |
| 12/10/2009 | 87.717 | 87.775 | 100.066 |
| 13/10/2009 | 86.801 | 86.861 | 100.07 |
| 14/10/2009 | 88.617 | 88.682 | 100.073 |
| 15/10/2009 | 88.348 | 88.407 | 100.066 |
| 16/10/2009 | 87.387 | 87.456 | 100.079 |
| 19/10/2009 | 88.771 | 88.838 | 100.075 |
| 20/10/2009 | 88.332 | 88.4 | 100.077 |
| 21/10/2009 | 88.508 | 88.57 | 100.07 |
| 22/10/2009 | 87.517 | 87.578 | 100.07 |
| 23/10/2009 | 87.159 | 87.217 | 100.066 |
| 26/10/2009 | 85.779 | 85.837 | 100.067 |
| 27/10/2009 | 85.718 | 85.781 | 100.074 |
| 28/10/2009 | 83.95 | 84.017 | 100.08 |
| 29/10/2009 | 85.386 | 85.452 | 100.078 |
| 30/10/2009 | 83.584 | 83.647 | 100.074 |
| 02/11/2009 | 83.943 | 83.997 | 100.065 |
| 03/11/2009 | 82.667 | 82.719 | 100.062 |
| 04/11/2009 | 84.185 | 84.234 | 100.058 |
| 05/11/2009 | 84.871 | 84.919 | 100.057 |
| 06/11/2009 | 84.903 | 84.947 | 100.051 |
| 09/11/2009 | 86.678 | 86.719 | 100.048 |
| 10/11/2009 | 86.431 | 86.472 | 100.047 |
| 11/11/2009 | 87.048 | 87.09 | 100.048 |
| 12/11/2009 | 86.952 | 86.99 | 100.044 |
| 13/11/2009 | 87.117 | 87.158 | 100.047 |
| 16/11/2009 | 88.306 | 88.346 | 100.046 |
| 17/11/2009 | 87.682 | 87.721 | 100.044 |
| 18/11/2009 | 87.795 | 87.832 | 100.042 |
| 19/11/2009 | 86.307 | 86.349 | 100.048 |
| 20/11/2009 | 85.662 | 85.702 | 100.046 |
| 23/11/2009 | 87.55 | 87.593 | 100.049 |
| 24/11/2009 | 86.924 | 86.966 | 100.049 |
| 25/11/2009 | 87.305 | 87.346 | 100.047 |
| 26/11/2009 | 84.587 | 84.63 | 100.051 |
| 27/11/2009 | 85.591 | 85.637 | 100.054 |
| 30/11/2009 | 84.53 | 84.577 | 100.057 |
| 01/12/2009 | 86.636 | 86.687 | 100.059 |
| 02/12/2009 | 86.982 | 87.032 | 100.058 |
| 03/12/2009 | 87.053 | 87.101 | 100.056 |
| 04/12/2009 | 87.957 | 88.006 | 100.056 |
| 07/12/2009 | 87.533 | 87.575 | 100.048 |
| 08/12/2009 | 86.247 | 86.287 | 100.046 |
| 09/12/2009 | 85.337 | 85.377 | 100.048 |
| 10/12/2009 | 86.171 | 86.214 | 100.05 |
| 11/12/2009 | 86.45 | 86.488 | 100.044 |
| 14/12/2009 | 87.077 | 87.113 | 100.041 |
| 15/12/2009 | 87.118 | 87.136 | 100.02 |
| 16/12/2009 | 88.216 | 88.253 | 100.041 |
| 17/12/2009 | 87.357 | 87.392 | 100.04 |
| 18/12/2009 | 86.916 | 86.95 | 100.038 |
| 21/12/2009 | 88.09 | 88.118 | 100.031 |
| 22/12/2009 | 88.786 | 88.81 | 100.028 |
| 23/12/2009 | 89.049 | 89.073 | 100.027 |
| 24/12/2009 | 89.011 | 89.036 | 100.027 |
| 25/12/2009 | 89.011 | 89.036 | 100.027 |
| 28/12/2009 | 89.587 | 89.036 | 99.385 |
| 29/12/2009 | 89.905 | 89.929 | 100.027 |
| 30/12/2009 | 89.265 | 89.287 | 100.025 |
| 31/12/2009 | 89.322 | 89.344 | 100.024 |
| 01/01/2010 | 89.322 | 89.344 | 100.024 |
| 04/01/2010 | 90.904 | 90.917 | 100.015 |
| 05/01/2010 | 90.857 | 90.867 | 100.011 |
| 06/01/2010 | 90.942 | 90.951 | 100.011 |
| 07/01/2010 | 90.954 | 90.963 | 100.009 |
| 08/01/2010 | 91.366 | 91.373 | 100.008 |
| 11/01/2010 | 91.29 | 91.296 | 100.006 |
| 12/01/2010 | 90.27 | 90.276 | 100.007 |
| 13/01/2010 | 90.441 | 90.449 | 100.009 |
| 14/01/2010 | 91.001 | 91.008 | 100.007 |
| 15/01/2010 | 89.918 | 89.924 | 100.006 |
| 18/01/2010 | 90.367 | 90.369 | 100.002 |
| 19/01/2010 | 90.899 | 90.897 | 99.997 |
| 20/01/2010 | 89.282 | 89.275 | 99.992 |
| 21/01/2010 | 88.188 | 88.178 | 99.988 |
| 22/01/2010 | 87.346 | 87.337 | 99.99 |
| 25/01/2010 | 86.655 | 86.646 | 99.989 |
| 26/01/2010 | 87.002 | 86.996 | 99.993 |
| 27/01/2010 | 86.221 | 86.222 | 100.001 |
| 28/01/2010 | 85.251 | 85.241 | 99.988 |
| 29/01/2010 | 86.271 | 86.256 | 99.982 |
| 01/02/2010 | 86.881 | 86.863 | 99.979 |
| 02/02/2010 | 87.791 | 87.772 | 99.978 |
| 03/02/2010 | 87.274 | 87.254 | 99.978 |
| 04/02/2010 | 84.701 | 84.687 | 99.983 |
| 05/02/2010 | 82.69 | 82.682 | 99.991 |
| 08/02/2010 | 83.359 | 83.356 | 99.996 |
| 09/02/2010 | 83.567 | 83.562 | 99.993 |
| 10/02/2010 | 84.208 | 84.192 | 99.982 |
| 11/02/2010 | 84.095 | 84.083 | 99.986 |
| 12/02/2010 | 83.816 | 83.8 | 99.981 |
| 15/02/2010 | 84.033 | 84.016 | 99.979 |
| 16/02/2010 | 84.966 | 84.948 | 99.978 |
| 17/02/2010 | 86.097 | 86.075 | 99.974 |
| 18/02/2010 | 86.626 | 86.605 | 99.976 |
| 19/02/2010 | 87.23 | 87.201 | 99.966 |
| 22/02/2010 | 86.969 | 86.937 | 99.963 |
| 23/02/2010 | 85.778 | 85.745 | 99.961 |
| 24/02/2010 | 85.994 | 85.963 | 99.964 |
| 25/02/2010 | 84.721 | 84.69 | 99.964 |
| 26/02/2010 | 85.892 | 85.862 | 99.965 |
| 01/03/2010 | 87.254 | 87.222 | 99.963 |
| 02/03/2010 | 88.023 | 87.989 | 99.961 |
| 03/03/2010 | 88.69 | 88.655 | 99.96 |
| 04/03/2010 | 88.74 | 88.705 | 99.961 |
| 05/03/2010 | 90.171 | 90.138 | 99.963 |
| 08/03/2010 | 90.254 | 90.216 | 99.958 |
| 09/03/2010 | 90.234 | 90.197 | 99.959 |
| 10/03/2010 | 91.026 | 90.989 | 99.96 |
| 11/03/2010 | 90.698 | 90.658 | 99.955 |
| 12/03/2010 | 90.889 | 90.855 | 99.962 |
| 15/03/2010 | 90.298 | 90.266 | 99.965 |
| 16/03/2010 | 91.23 | 91.199 | 99.966 |
| 17/03/2010 | 91.892 | 91.859 | 99.964 |
| 18/03/2010 | 91.541 | 91.511 | 99.967 |
| 19/03/2010 | 91.4 | 91.363 | 99.96 |
| 22/03/2010 | 91.231 | 91.189 | 99.954 |
| 23/03/2010 | 91.909 | 91.868 | 99.955 |
| 24/03/2010 | 91.889 | 91.85 | 99.957 |
| 25/03/2010 | 92.898 | 92.859 | 99.958 |
| 26/03/2010 | 92.596 | 92.558 | 99.959 |
| 29/03/2010 | 92.712 | 92.676 | 99.961 |
| 30/03/2010 | 92.488 | 92.452 | 99.96 |
| 31/03/2010 | 92.458 | 92.42 | 99.958 |
| 01/04/2010 | 93.73 | 93.683 | 99.949 |
| 02/04/2010 | 93.73 | 93.683 | 99.949 |
| 05/04/2010 | 93.576 | 93.683 | 100.115 |
| 06/04/2010 | 94.045 | 93.992 | 99.944 |
| 07/04/2010 | 93.635 | 93.583 | 99.945 |
| 08/04/2010 | 92.734 | 92.681 | 99.943 |
| 09/04/2010 | 94.071 | 94.021 | 99.948 |
| 12/04/2010 | 94.285 | 94.24 | 99.952 |
| 13/04/2010 | 94.016 | 93.969 | 99.951 |
| 14/04/2010 | 94.632 | 94.586 | 99.951 |
| 15/04/2010 | 95.001 | 94.955 | 99.952 |
| 16/04/2010 | 93.525 | 93.481 | 99.954 |
| 19/04/2010 | 93.01 | 92.971 | 99.958 |
| 20/04/2010 | 94.282 | 94.234 | 99.948 |
| 21/04/2010 | 93.574 | 93.521 | 99.943 |
| 22/04/2010 | 92.261 | 92.211 | 99.945 |
| 23/04/2010 | 93.214 | 93.165 | 99.948 |
| 26/04/2010 | 93.896 | 93.85 | 99.951 |
| 27/04/2010 | 91.059 | 91.026 | 99.964 |
| 28/04/2010 | 89.598 | 89.578 | 99.978 |
| 29/04/2010 | 91.096 | 91.061 | 99.961 |
| 30/04/2010 | 90.835 | 90.81 | 99.973 |
| 03/05/2010 | 91.073 | 90.81 | 99.711 |
| 04/05/2010 | 88.222 | 88.224 | 100.002 |
| 05/05/2010 | 87.005 | 87.039 | 100.04 |
| 06/05/2010 | 85.707 | 85.753 | 100.053 |
| 07/05/2010 | 82.567 | 82.648 | 100.098 |
| 10/05/2010 | 88.98 | 88.99 | 100.012 |
| 11/05/2010 | 88.696 | 88.71 | 100.017 |
| 12/05/2010 | 90.162 | 90.154 | 99.991 |
| 13/05/2010 | 90.256 | 90.244 | 99.987 |
| 14/05/2010 | 86.95 | 87.022 | 100.082 |
| 17/05/2010 | 86.892 | 86.977 | 100.097 |
| 18/05/2010 | 88.335 | 88.407 | 100.081 |
| 19/05/2010 | 85.744 | 85.856 | 100.131 |
| 20/05/2010 | 83.92 | 84.065 | 100.172 |
| 21/05/2010 | 83.708 | 83.84 | 100.158 |
| 24/05/2010 | 83.705 | 83.837 | 100.158 |
| 25/05/2010 | 81.511 | 81.685 | 100.213 |
| 26/05/2010 | 83.285 | 83.447 | 100.194 |
| 27/05/2010 | 85.756 | 85.908 | 100.178 |
| 28/05/2010 | 85.7 | 85.864 | 100.191 |
| 31/05/2010 | 85.823 | 85.998 | 100.203 |
| 01/06/2010 | 85.78 | 85.953 | 100.202 |
| 02/06/2010 | 85.978 | 86.159 | 100.21 |
| 03/06/2010 | 87.18 | 87.356 | 100.202 |
| 04/06/2010 | 85.183 | 85.371 | 100.221 |
| 07/06/2010 | 84.521 | 84.721 | 100.236 |
| 08/06/2010 | 83.931 | 84.139 | 100.248 |
| 09/06/2010 | 85.53 | 85.731 | 100.235 |
| 10/06/2010 | 87.088 | 87.278 | 100.218 |
| 11/06/2010 | 87.644 | 87.806 | 100.186 |
| 14/06/2010 | 88.902 | 89.066 | 100.184 |
| 15/06/2010 | 89.718 | 89.883 | 100.184 |
| 16/06/2010 | 89.67 | 89.836 | 100.185 |
| 17/06/2010 | 90.038 | 90.199 | 100.179 |
| 18/06/2010 | 90.414 | 90.569 | 100.172 |
| 21/06/2010 | 91.43 | 91.579 | 100.163 |
| 22/06/2010 | 90.917 | 91.075 | 100.174 |
| 23/06/2010 | 89.712 | 89.879 | 100.186 |
| 24/06/2010 | 87.994 | 88.172 | 100.202 |
| 25/06/2010 | 87.577 | 87.763 | 100.211 |
| 28/06/2010 | 88.745 | 88.92 | 100.197 |
| 29/06/2010 | 85.75 | 85.944 | 100.227 |
| 30/06/2010 | 85.981 | 86.173 | 100.223 |
| 01/07/2010 | 84.003 | 84.207 | 100.243 |
| 02/07/2010 | 83.966 | 84.168 | 100.24 |
| 05/07/2010 | 83.739 | 83.943 | 100.243 |
| 06/07/2010 | 85.819 | 86.007 | 100.218 |
| 07/07/2010 | 87.13 | 87.306 | 100.202 |
| 08/07/2010 | 87.989 | 88.156 | 100.19 |
| 09/07/2010 | 88.546 | 88.71 | 100.185 |
| 12/07/2010 | 88.771 | 88.929 | 100.177 |
| 13/07/2010 | 90.469 | 90.61 | 100.155 |
| 14/07/2010 | 90.54 | 90.679 | 100.154 |
| 15/07/2010 | 89.602 | 89.753 | 100.168 |
| 16/07/2010 | 87.759 | 87.927 | 100.191 |
| 19/07/2010 | 87.274 | 87.446 | 100.197 |
| 20/07/2010 | 87.106 | 87.273 | 100.192 |
| 21/07/2010 | 87.829 | 87.984 | 100.177 |
| 22/07/2010 | 89.892 | 90.034 | 100.158 |
| 23/07/2010 | 89.957 | 90.099 | 100.157 |
| 26/07/2010 | 90.437 | 90.57 | 100.147 |
| 27/07/2010 | 90.777 | 90.909 | 100.145 |
| 28/07/2010 | 90.597 | 90.732 | 100.149 |
| 29/07/2010 | 90.39 | 90.52 | 100.144 |
| 30/07/2010 | 90.055 | 90.182 | 100.141 |
| 02/08/2010 | 92.352 | 92.466 | 100.123 |
| 03/08/2010 | 92.336 | 92.442 | 100.116 |
| 04/08/2010 | 92.43 | 92.537 | 100.116 |
| 05/08/2010 | 92.339 | 92.442 | 100.111 |
| 06/08/2010 | 91.228 | 91.342 | 100.125 |
| 09/08/2010 | 92.332 | 92.432 | 100.108 |
| 10/08/2010 | 91.518 | 91.628 | 100.12 |
| 11/08/2010 | 89.464 | 89.588 | 100.138 |
| 12/08/2010 | 89.531 | 89.655 | 100.139 |
| 13/08/2010 | 89.466 | 89.591 | 100.14 |
| 16/08/2010 | 89.531 | 89.65 | 100.134 |
| 17/08/2010 | 90.758 | 90.863 | 100.116 |
| 18/08/2010 | 90.583 | 90.689 | 100.117 |
| 19/08/2010 | 89.286 | 89.399 | 100.126 |
| 20/08/2010 | 88.258 | 88.376 | 100.134 |
| 23/08/2010 | 88.688 | 88.801 | 100.127 |
| 24/08/2010 | 87.355 | 87.481 | 100.145 |
| 25/08/2010 | 86.632 | 86.758 | 100.146 |
| 26/08/2010 | 87.318 | 87.438 | 100.138 |
| 27/08/2010 | 88.005 | 88.124 | 100.136 |
| 30/08/2010 | 87.868 | 88.124 | 100.292 |
| 31/08/2010 | 88.135 | 88.246 | 100.126 |
| 01/09/2010 | 90.697 | 90.806 | 100.12 |
| 02/09/2010 | 90.823 | 90.934 | 100.122 |
| 03/09/2010 | 91.534 | 91.647 | 100.123 |
| 06/09/2010 | 91.859 | 91.97 | 100.121 |
| 07/09/2010 | 91.284 | 91.391 | 100.117 |
| 08/09/2010 | 92.004 | 92.107 | 100.111 |
| 09/09/2010 | 92.905 | 93.004 | 100.106 |
| 10/09/2010 | 92.854 | 92.952 | 100.105 |
| 13/09/2010 | 93.594 | 93.69 | 100.103 |
| 14/09/2010 | 93.739 | 93.827 | 100.094 |
| 15/09/2010 | 93.165 | 93.251 | 100.093 |
| 16/09/2010 | 92.483 | 92.568 | 100.092 |
| 17/09/2010 | 92.192 | 92.275 | 100.091 |
| 20/09/2010 | 93.56 | 93.644 | 100.089 |
| 21/09/2010 | 93.366 | 93.451 | 100.091 |
| 22/09/2010 | 92.186 | 92.273 | 100.095 |
| 23/09/2010 | 91.744 | 91.828 | 100.091 |
| 24/09/2010 | 93.053 | 93.137 | 100.091 |
| 27/09/2010 | 92.585 | 92.667 | 100.089 |
| 28/09/2010 | 92.592 | 92.671 | 100.085 |
| 29/09/2010 | 92.133 | 92.212 | 100.086 |
| 30/09/2010 | 91.915 | 91.99 | 100.081 |
| 01/10/2010 | 91.406 | 91.474 | 100.075 |
| 04/10/2010 | 90.654 | 90.728 | 100.082 |
| 05/10/2010 | 92.111 | 92.182 | 100.076 |
| 06/10/2010 | 92.695 | 92.756 | 100.065 |
| 07/10/2010 | 92.764 | 92.822 | 100.062 |
| 08/10/2010 | 92.774 | 92.833 | 100.063 |
| 11/10/2010 | 93.095 | 93.176 | 100.087 |
| 12/10/2010 | 92.955 | 93.018 | 100.068 |
| 13/10/2010 | 94.512 | 94.572 | 100.064 |
| 14/10/2010 | 94.279 | 94.336 | 100.06 |
| 15/10/2010 | 94.357 | 94.42 | 100.067 |
| 18/10/2010 | 94.655 | 94.717 | 100.065 |
| 19/10/2010 | 94.126 | 94.195 | 100.074 |
| 20/10/2010 | 94.612 | 94.679 | 100.07 |
| 21/10/2010 | 95.488 | 95.548 | 100.064 |
| 22/10/2010 | 95.199 | 95.254 | 100.058 |
| 25/10/2010 | 95.503 | 95.551 | 100.051 |
| 26/10/2010 | 94.803 | 94.85 | 100.049 |
| 27/10/2010 | 94.196 | 94.243 | 100.051 |
| 28/10/2010 | 94.445 | 94.494 | 100.052 |
| 29/10/2010 | 94.366 | 94.417 | 100.054 |
| 01/11/2010 | 94.227 | 94.277 | 100.053 |
| 02/11/2010 | 94.909 | 94.961 | 100.055 |
| 03/11/2010 | 94.204 | 94.256 | 100.054 |
| 04/11/2010 | 95.709 | 95.754 | 100.047 |
| 05/11/2010 | 95.78 | 95.824 | 100.046 |
| 08/11/2010 | 95.734 | 95.831 | 100.101 |
| 09/11/2010 | 96.458 | 96.547 | 100.093 |
| 10/11/2010 | 95.47 | 95.562 | 100.097 |
| 11/11/2010 | 95.014 | 95.1 | 100.091 |
| 12/11/2010 | 94.703 | 94.786 | 100.088 |
| 15/11/2010 | 95.504 | 95.581 | 100.081 |
| 16/11/2010 | 93.594 | 93.676 | 100.087 |
| 17/11/2010 | 94.146 | 94.224 | 100.083 |
| 18/11/2010 | 95.552 | 95.627 | 100.079 |
| 19/11/2010 | 95.274 | 95.349 | 100.078 |
| 22/11/2010 | 94.584 | 94.661 | 100.082 |
| 23/11/2010 | 92.834 | 92.924 | 100.096 |
| 24/11/2010 | 93.768 | 93.857 | 100.094 |
| 25/11/2010 | 94.146 | 94.227 | 100.086 |
| 26/11/2010 | 93.69 | 93.779 | 100.095 |
| 29/11/2010 | 92.117 | 92.197 | 100.087 |
| 30/11/2010 | 91.777 | 91.859 | 100.089 |
| 01/12/2010 | 93.773 | 93.862 | 100.095 |
| 02/12/2010 | 95.482 | 95.57 | 100.092 |
| 03/12/2010 | 95.552 | 95.639 | 100.091 |
| 06/12/2010 | 95.33 | 95.406 | 100.079 |
| 07/12/2010 | 96.118 | 96.198 | 100.083 |
| 08/12/2010 | 96.472 | 96.562 | 100.093 |
| 09/12/2010 | 96.853 | 96.953 | 100.104 |
| 10/12/2010 | 96.936 | 97.032 | 100.099 |
| 13/12/2010 | 97.366 | 97.456 | 100.092 |
| 14/12/2010 | 97.685 | 97.778 | 100.095 |
| 15/12/2010 | 97.445 | 97.531 | 100.088 |
| 16/12/2010 | 97.605 | 97.696 | 100.093 |
| 17/12/2010 | 97.237 | 97.322 | 100.087 |
| 20/12/2010 | 97.822 | 97.898 | 100.078 |
| 21/12/2010 | 98.989 | 99.072 | 100.083 |
| 22/12/2010 | 99.027 | 99.108 | 100.082 |
| 23/12/2010 | 98.959 | 99.025 | 100.067 |
| 24/12/2010 | 98.764 | 98.829 | 100.066 |
| 27/12/2010 | 97.843 | 98.829 | 101.008 |
| 28/12/2010 | 98.102 | 98.829 | 100.741 |
| 29/12/2010 | 98.526 | 98.585 | 100.06 |
| 30/12/2010 | 97.451 | 97.507 | 100.058 |
| 31/12/2010 | 97.027 | 97.081 | 100.056 |
| 03/01/2011 | 98.541 | 97.081 | 98.519 |
| 04/01/2011 | 98.352 | 98.4 | 100.049 |
| 05/01/2011 | 97.935 | 97.986 | 100.052 |
| 06/01/2011 | 98.194 | 98.247 | 100.054 |
| 07/01/2011 | 97.784 | 97.833 | 100.05 |
| 10/01/2011 | 96.556 | 96.603 | 100.049 |
| 11/01/2011 | 97.852 | 97.902 | 100.051 |
| 12/01/2011 | 99.629 | 99.683 | 100.054 |
| 13/01/2011 | 99.446 | 99.521 | 100.076 |
| 14/01/2011 | 99.475 | 99.55 | 100.075 |
| 17/01/2011 | 99.437 | 99.514 | 100.078 |
| 18/01/2011 | 100.399 | 100.475 | 100.076 |
| 19/01/2011 | 99.368 | 99.449 | 100.082 |
| 20/01/2011 | 98.655 | 98.757 | 100.103 |
| 21/01/2011 | 99.597 | 99.704 | 100.108 |
| 24/01/2011 | 99.906 | 100.012 | 100.106 |
| 25/01/2011 | 99.634 | 99.741 | 100.107 |
| 26/01/2011 | 100.395 | 100.497 | 100.102 |
| 27/01/2011 | 100.59 | 100.688 | 100.097 |
| 28/01/2011 | 99.896 | 99.963 | 100.067 |
| 31/01/2011 | 99.623 | 99.695 | 100.072 |
| 01/02/2011 | 100.979 | 101.053 | 100.073 |
| 02/02/2011 | 100.845 | 100.92 | 100.075 |
| 03/02/2011 | 100.651 | 100.724 | 100.072 |
| 04/02/2011 | 100.895 | 100.957 | 100.062 |
| 07/02/2011 | 101.722 | 101.776 | 100.054 |
| 08/02/2011 | 101.828 | 101.881 | 100.052 |
| 09/02/2011 | 101.53 | 101.586 | 100.056 |
| 10/02/2011 | 101.251 | 101.312 | 100.06 |
| 11/02/2011 | 101.592 | 101.653 | 100.06 |
| 14/02/2011 | 101.831 | 101.877 | 100.045 |
| 15/02/2011 | 101.933 | 101.974 | 100.041 |
| 16/02/2011 | 102.625 | 102.665 | 100.039 |
| 17/02/2011 | 102.736 | 102.781 | 100.044 |
| 18/02/2011 | 102.789 | 102.832 | 100.042 |
| 21/02/2011 | 101.419 | 101.462 | 100.042 |
| 22/02/2011 | 100.873 | 100.91 | 100.037 |
| 23/02/2011 | 99.953 | 99.991 | 100.038 |
| 24/02/2011 | 99.587 | 99.621 | 100.035 |
| 25/02/2011 | 100.708 | 100.731 | 100.022 |
| 28/02/2011 | 101.638 | 101.65 | 100.012 |
| 01/03/2011 | 101.079 | 101.094 | 100.015 |
| 02/03/2011 | 100.372 | 100.385 | 100.014 |
| 03/03/2011 | 100.507 | 100.52 | 100.013 |
| 04/03/2011 | 99.926 | 99.94 | 100.014 |
| 07/03/2011 | 99.589 | 99.6 | 100.011 |
| 08/03/2011 | 99.972 | 99.981 | 100.009 |
| 09/03/2011 | 99.794 | 99.803 | 100.009 |
| 10/03/2011 | 98.887 | 98.897 | 100.01 |
| 11/03/2011 | 98.005 | 98.023 | 100.018 |
| 14/03/2011 | 96.853 | 96.872 | 100.019 |
| 15/03/2011 | 94.546 | 94.569 | 100.024 |
| 16/03/2011 | 93.095 | 93.118 | 100.024 |
| 17/03/2011 | 94.896 | 94.914 | 100.019 |
| 18/03/2011 | 95.251 | 95.27 | 100.02 |
| 21/03/2011 | 97.061 | 97.075 | 100.015 |
| 22/03/2011 | 96.767 | 96.781 | 100.014 |
| 23/03/2011 | 97.331 | 97.344 | 100.013 |
| 24/03/2011 | 98.572 | 98.585 | 100.013 |
| 25/03/2011 | 98.614 | 98.635 | 100.022 |
| 28/03/2011 | 98.794 | 98.813 | 100.02 |
| 29/03/2011 | 98.744 | 98.763 | 100.019 |
| 30/03/2011 | 99.538 | 99.553 | 100.015 |
| 31/03/2011 | 98.879 | 98.895 | 100.017 |
| 01/04/2011 | 100.143 | 100.175 | 100.032 |
| 04/04/2011 | 100.217 | 100.251 | 100.034 |
| 05/04/2011 | 100.14 | 100.176 | 100.035 |
| 06/04/2011 | 100.571 | 100.608 | 100.036 |
| 07/04/2011 | 100.285 | 100.321 | 100.036 |
| 08/04/2011 | 100.691 | 100.721 | 100.03 |
| 11/04/2011 | 100.334 | 100.365 | 100.031 |
| 12/04/2011 | 99.062 | 99.093 | 100.031 |
| 13/04/2011 | 99.726 | 99.757 | 100.031 |
| 14/04/2011 | 99.117 | 99.16 | 100.043 |
| 15/04/2011 | 99.299 | 99.353 | 100.055 |
| 18/04/2011 | 97.464 | 97.515 | 100.052 |
| 19/04/2011 | 98.006 | 98.057 | 100.052 |
| 20/04/2011 | 99.926 | 99.978 | 100.053 |
| 21/04/2011 | 100.473 | 100.543 | 100.069 |
| 22/04/2011 | 100.473 | 100.543 | 100.069 |
| 25/04/2011 | 100.498 | 100.543 | 100.045 |
| 26/04/2011 | 101.057 | 101.11 | 100.053 |
| 27/04/2011 | 101.424 | 101.477 | 100.052 |
| 28/04/2011 | 102.097 | 102.151 | 100.053 |
| 29/04/2011 | 102.57 | 102.621 | 100.05 |
| 02/05/2011 | 102.823 | 102.151 | 99.346 |
| 03/05/2011 | 102.456 | 102.526 | 100.068 |
| 04/05/2011 | 101.133 | 101.219 | 100.085 |
| 05/05/2011 | 100.82 | 100.922 | 100.101 |
| 06/05/2011 | 102.018 | 102.146 | 100.126 |
| 09/05/2011 | 101.366 | 101.497 | 100.13 |
| 10/05/2011 | 102.283 | 102.415 | 100.129 |
| 11/05/2011 | 102.546 | 102.681 | 100.131 |
| 12/05/2011 | 101.988 | 102.12 | 100.129 |
| 13/05/2011 | 101.667 | 101.835 | 100.165 |
| 16/05/2011 | 101.609 | 101.784 | 100.172 |
| 17/05/2011 | 100.415 | 100.593 | 100.177 |
| 18/05/2011 | 100.924 | 101.105 | 100.179 |
| 19/05/2011 | 101.567 | 101.751 | 100.182 |
| 20/05/2011 | 101.092 | 101.26 | 100.166 |
| 23/05/2011 | 99.331 | 99.524 | 100.195 |
| 24/05/2011 | 99.566 | 99.759 | 100.194 |
| 25/05/2011 | 100.192 | 100.392 | 100.2 |
| 26/05/2011 | 99.886 | 100.09 | 100.204 |
| 27/05/2011 | 100.638 | 100.862 | 100.223 |
| 30/05/2011 | 100.559 | 100.862 | 100.301 |
| 31/05/2011 | 101.792 | 102.008 | 100.213 |
| 01/06/2011 | 101.115 | 101.332 | 100.215 |
| 02/06/2011 | 99.96 | 100.17 | 100.21 |
| 03/06/2011 | 99.673 | 99.872 | 100.2 |
| 06/06/2011 | 98.98 | 99.196 | 100.219 |
| 07/06/2011 | 98.764 | 98.986 | 100.224 |
| 08/06/2011 | 97.712 | 97.934 | 100.227 |
| 09/06/2011 | 98.55 | 98.772 | 100.225 |
| 10/06/2011 | 97.28 | 97.501 | 100.227 |
| 13/06/2011 | 97.392 | 97.61 | 100.224 |
| 14/06/2011 | 98.346 | 98.573 | 100.231 |
| 15/06/2011 | 97.059 | 97.282 | 100.23 |
| 16/06/2011 | 96.704 | 96.934 | 100.238 |
| 17/06/2011 | 97.215 | 97.448 | 100.239 |
| 20/06/2011 | 96.593 | 96.82 | 100.236 |
| 21/06/2011 | 98.174 | 98.416 | 100.246 |
| 22/06/2011 | 97.786 | 98.034 | 100.253 |
| 23/06/2011 | 96.107 | 96.345 | 100.248 |
| 24/06/2011 | 95.829 | 96.064 | 100.245 |
| 27/06/2011 | 95.938 | 96.17 | 100.242 |
| 28/06/2011 | 96.538 | 96.777 | 100.248 |
| 29/06/2011 | 98.284 | 98.526 | 100.247 |
| 30/06/2011 | 99.467 | 99.711 | 100.246 |
| 01/07/2011 | 100.173 | 100.424 | 100.25 |
| 04/07/2011 | 100.319 | 100.566 | 100.245 |
| 05/07/2011 | 100.098 | 100.358 | 100.26 |
| 06/07/2011 | 99.689 | 99.931 | 100.243 |
| 07/07/2011 | 100.097 | 100.351 | 100.254 |
| 08/07/2011 | 98.899 | 99.134 | 100.238 |
| 11/07/2011 | 96.984 | 97.214 | 100.237 |
| 12/07/2011 | 96.422 | 96.647 | 100.234 |
| 13/07/2011 | 97.18 | 97.413 | 100.24 |
| 14/07/2011 | 96.367 | 96.601 | 100.243 |
| 15/07/2011 | 95.942 | 96.188 | 100.257 |
| 18/07/2011 | 94.146 | 94.386 | 100.255 |
| 19/07/2011 | 95.097 | 95.34 | 100.255 |
| 20/07/2011 | 96.509 | 96.757 | 100.257 |
| 21/07/2011 | 97.755 | 98.022 | 100.272 |
| 22/07/2011 | 98.208 | 98.47 | 100.267 |
| 25/07/2011 | 97.919 | 98.174 | 100.261 |
| 26/07/2011 | 97.445 | 97.7 | 100.262 |
| 27/07/2011 | 96.211 | 96.46 | 100.259 |
| 28/07/2011 | 95.875 | 96.128 | 100.263 |
| 29/07/2011 | 95.307 | 95.555 | 100.26 |
| 01/08/2011 | 93.858 | 94.103 | 100.261 |
| 02/08/2011 | 91.681 | 91.912 | 100.252 |
| 03/08/2011 | 89.909 | 90.139 | 100.255 |
| 04/08/2011 | 86.578 | 86.8 | 100.256 |
| 05/08/2011 | 85.348 | 85.568 | 100.257 |
| 08/08/2011 | 81.78 | 81.994 | 100.263 |
| 09/08/2011 | 82.995 | 83.199 | 100.245 |
| 10/08/2011 | 79.655 | 79.829 | 100.219 |
| 11/08/2011 | 81.48 | 81.674 | 100.237 |
| 12/08/2011 | 84.422 | 84.623 | 100.238 |
| 15/08/2011 | 84.703 | 84.903 | 100.237 |
| 16/08/2011 | 84.344 | 84.546 | 100.24 |
| 17/08/2011 | 84.602 | 84.807 | 100.243 |
| 18/08/2011 | 80.357 | 80.549 | 100.239 |
| 19/08/2011 | 78.868 | 79.056 | 100.238 |
| 22/08/2011 | 79.571 | 79.758 | 100.235 |
| 23/08/2011 | 80.141 | 80.33 | 100.236 |
| 24/08/2011 | 81.506 | 81.72 | 100.262 |
| 25/08/2011 | 80.751 | 80.969 | 100.27 |
| 26/08/2011 | 80.066 | 80.292 | 100.282 |
| 29/08/2011 | 81.542 | 80.292 | 98.467 |
| 30/08/2011 | 81.774 | 82.001 | 100.278 |
| 31/08/2011 | 84.305 | 84.537 | 100.276 |
| 01/09/2011 | 84.805 | 85.038 | 100.274 |
| 02/09/2011 | 82.445 | 82.67 | 100.272 |
| 05/09/2011 | 78.743 | 78.954 | 100.268 |
| 06/09/2011 | 77.657 | 77.868 | 100.272 |
| 07/09/2011 | 80.218 | 80.432 | 100.267 |
| 08/09/2011 | 80.496 | 80.71 | 100.266 |
| 09/09/2011 | 77.926 | 78.134 | 100.268 |
| 12/09/2011 | 75.545 | 75.751 | 100.273 |
| 13/09/2011 | 76.485 | 76.69 | 100.269 |
| 14/09/2011 | 77.965 | 78.175 | 100.27 |
| 15/09/2011 | 79.863 | 80.078 | 100.268 |
| 16/09/2011 | 80.194 | 80.406 | 100.264 |
| 19/09/2011 | 78.215 | 78.421 | 100.263 |
| 20/09/2011 | 79.748 | 79.958 | 100.263 |
| 21/09/2011 | 78.531 | 78.738 | 100.264 |
| 22/09/2011 | 74.894 | 75.09 | 100.261 |
| 23/09/2011 | 75.325 | 75.523 | 100.262 |
| 26/09/2011 | 76.916 | 77.12 | 100.266 |
| 27/09/2011 | 80.524 | 80.738 | 100.266 |
| 28/09/2011 | 79.771 | 79.982 | 100.265 |
| 29/09/2011 | 80.809 | 81.023 | 100.265 |
| 30/09/2011 | 79.51 | 79.728 | 100.275 |
| 03/10/2011 | 78.356 | 78.57 | 100.274 |
| 04/10/2011 | 76.37 | 76.578 | 100.272 |
| 05/10/2011 | 78.755 | 78.972 | 100.276 |
| 06/10/2011 | 80.927 | 81.152 | 100.277 |
| 07/10/2011 | 81.358 | 81.579 | 100.271 |
| 10/10/2011 | 83.085 | 83.308 | 100.268 |
| 11/10/2011 | 82.855 | 83.076 | 100.267 |
| 12/10/2011 | 84.617 | 84.841 | 100.265 |
| 13/10/2011 | 83.384 | 83.603 | 100.263 |
| 14/10/2011 | 84.27 | 84.492 | 100.263 |
| 17/10/2011 | 83.127 | 83.35 | 100.269 |
| 18/10/2011 | 82.974 | 83.2 | 100.272 |
| 19/10/2011 | 83.261 | 83.498 | 100.286 |
| 20/10/2011 | 81.968 | 82.202 | 100.286 |
| 21/10/2011 | 84.206 | 84.445 | 100.284 |
| 24/10/2011 | 85.232 | 85.472 | 100.281 |
| 25/10/2011 | 84.533 | 84.769 | 100.279 |
| 26/10/2011 | 84.504 | 84.736 | 100.275 |
| 27/10/2011 | 88.436 | 88.681 | 100.278 |
| 28/10/2011 | 88.178 | 88.422 | 100.277 |
| 31/10/2011 | 85.759 | 85.994 | 100.274 |
| 01/11/2011 | 82.015 | 82.24 | 100.274 |
| 02/11/2011 | 82.974 | 83.2 | 100.273 |
| 03/11/2011 | 84.904 | 85.135 | 100.272 |
| 04/11/2011 | 83.588 | 83.816 | 100.272 |
| 07/11/2011 | 83.064 | 83.306 | 100.291 |
| 08/11/2011 | 83.73 | 83.974 | 100.291 |
| 09/11/2011 | 82.036 | 82.271 | 100.287 |
| 10/11/2011 | 81.893 | 82.128 | 100.287 |
| 11/11/2011 | 83.993 | 84.233 | 100.286 |
| 14/11/2011 | 83.062 | 83.297 | 100.282 |
| 15/11/2011 | 82.187 | 82.42 | 100.284 |
| 16/11/2011 | 82.387 | 82.626 | 100.289 |
| 17/11/2011 | 81.417 | 81.652 | 100.289 |
| 18/11/2011 | 80.989 | 81.228 | 100.295 |
| 21/11/2011 | 78.434 | 78.665 | 100.295 |
| 22/11/2011 | 77.805 | 78.035 | 100.296 |
| 23/11/2011 | 76.668 | 76.894 | 100.295 |
| 24/11/2011 | 76.469 | 76.697 | 100.298 |
| 25/11/2011 | 76.906 | 77.134 | 100.296 |
| 28/11/2011 | 80.223 | 80.458 | 100.293 |
| 29/11/2011 | 80.73 | 80.966 | 100.293 |
| 30/11/2011 | 83.989 | 84.233 | 100.291 |
| 01/12/2011 | 83.441 | 83.683 | 100.29 |
| 02/12/2011 | 84.197 | 84.438 | 100.286 |
| 05/12/2011 | 85.036 | 85.277 | 100.284 |
| 06/12/2011 | 84.617 | 84.855 | 100.281 |
| 07/12/2011 | 84.358 | 84.593 | 100.278 |
| 08/12/2011 | 82.776 | 83.007 | 100.279 |
| 09/12/2011 | 84.128 | 84.364 | 100.281 |
| 12/12/2011 | 82.12 | 82.349 | 100.278 |
| 13/12/2011 | 82.124 | 82.351 | 100.276 |
| 14/12/2011 | 80.437 | 80.66 | 100.277 |
| 15/12/2011 | 81.325 | 81.548 | 100.275 |
| 16/12/2011 | 80.907 | 81.127 | 100.271 |
| 19/12/2011 | 81.053 | 81.272 | 100.27 |
| 20/12/2011 | 82.951 | 83.174 | 100.269 |
| 21/12/2011 | 82.445 | 82.666 | 100.268 |
| 22/12/2011 | 83.246 | 83.467 | 100.265 |
| 23/12/2011 | 83.931 | 84.155 | 100.266 |
| 26/12/2011 | 83.931 | 84.155 | 100.266 |
| 27/12/2011 | 83.963 | 84.155 | 100.229 |
| 28/12/2011 | 83.226 | 83.445 | 100.263 |
| 29/12/2011 | 84.117 | 84.353 | 100.28 |
| 30/12/2011 | 84.973 | 85.209 | 100.277 |
| 02/01/2012 | 86.362 | 85.209 | 98.665 |
| 03/01/2012 | 87.332 | 87.573 | 100.277 |
| 04/01/2012 | 86.414 | 86.66 | 100.285 |
| 05/01/2012 | 85.577 | 85.821 | 100.285 |
| 06/01/2012 | 85.342 | 85.583 | 100.283 |
| 09/01/2012 | 85.025 | 85.254 | 100.269 |
| 10/01/2012 | 86.745 | 86.986 | 100.278 |
| 11/01/2012 | 86.464 | 86.707 | 100.281 |
| 12/01/2012 | 86.695 | 86.932 | 100.273 |
| 13/01/2012 | 86.349 | 86.581 | 100.27 |
| 16/01/2012 | 87.114 | 87.352 | 100.273 |
| 17/01/2012 | 88.109 | 88.35 | 100.273 |
| 18/01/2012 | 88.263 | 88.508 | 100.277 |
| 19/01/2012 | 89.642 | 89.894 | 100.281 |
| 20/01/2012 | 89.257 | 89.51 | 100.284 |
| 23/01/2012 | 89.734 | 89.96 | 100.252 |
| 24/01/2012 | 89.329 | 89.58 | 100.281 |
| 25/01/2012 | 88.938 | 89.195 | 100.29 |
| 26/01/2012 | 90.214 | 90.473 | 100.287 |
| 27/01/2012 | 89.376 | 89.635 | 100.29 |
| 30/01/2012 | 88.298 | 88.553 | 100.289 |
| 31/01/2012 | 88.763 | 89.018 | 100.287 |
| 01/02/2012 | 90.688 | 90.946 | 100.285 |
| 02/02/2012 | 90.929 | 91.187 | 100.283 |
| 03/02/2012 | 92.287 | 92.546 | 100.28 |
| 06/02/2012 | 92.026 | 92.278 | 100.274 |
| 07/02/2012 | 92.07 | 92.322 | 100.274 |
| 08/02/2012 | 92.125 | 92.375 | 100.271 |
| 09/02/2012 | 92.415 | 92.665 | 100.27 |
| 10/02/2012 | 91.359 | 91.606 | 100.27 |
| 13/02/2012 | 91.918 | 92.164 | 100.267 |
| 14/02/2012 | 91.738 | 91.982 | 100.267 |
| 15/02/2012 | 92.315 | 92.56 | 100.266 |
| 16/02/2012 | 92.23 | 92.474 | 100.265 |
| 17/02/2012 | 93.14 | 93.388 | 100.267 |
| 20/02/2012 | 94.163 | 94.411 | 100.263 |
| 21/02/2012 | 93.75 | 93.997 | 100.263 |
| 22/02/2012 | 93.026 | 93.272 | 100.264 |
| 23/02/2012 | 92.779 | 93.025 | 100.265 |
| 24/02/2012 | 93.191 | 93.437 | 100.264 |
| 27/02/2012 | 92.792 | 93.036 | 100.263 |
| 28/02/2012 | 93.03 | 93.274 | 100.262 |
| 29/02/2012 | 92.9 | 93.14 | 100.259 |
| 01/03/2012 | 93.734 | 93.973 | 100.255 |
| 02/03/2012 | 93.82 | 94.066 | 100.263 |
| 05/03/2012 | 93.317 | 93.562 | 100.262 |
| 06/03/2012 | 90.457 | 90.695 | 100.262 |
| 07/03/2012 | 91.173 | 91.411 | 100.261 |
| 08/03/2012 | 93.053 | 93.3 | 100.266 |
| 09/03/2012 | 93.328 | 93.572 | 100.261 |
| 12/03/2012 | 93.265 | 93.505 | 100.258 |
| 13/03/2012 | 94.739 | 94.983 | 100.258 |
| 14/03/2012 | 95.083 | 95.33 | 100.259 |
| 15/03/2012 | 95.755 | 96.002 | 100.258 |
| 16/03/2012 | 96.128 | 96.383 | 100.265 |
| 19/03/2012 | 96.121 | 96.377 | 100.266 |
| 20/03/2012 | 95.082 | 95.334 | 100.265 |
| 21/03/2012 | 94.84 | 95.092 | 100.265 |
| 22/03/2012 | 93.683 | 93.935 | 100.269 |
| 23/03/2012 | 93.768 | 94.013 | 100.261 |
| 26/03/2012 | 94.665 | 94.912 | 100.261 |
| 27/03/2012 | 94.172 | 94.417 | 100.259 |
| 28/03/2012 | 93.401 | 93.645 | 100.261 |
| 29/03/2012 | 91.958 | 92.196 | 100.26 |
| 30/03/2012 | 93.072 | 93.318 | 100.264 |
| 02/04/2012 | 94.189 | 94.44 | 100.266 |
| 03/04/2012 | 93.158 | 93.403 | 100.262 |
| 04/04/2012 | 90.842 | 91.076 | 100.258 |
| 05/04/2012 | 90.833 | 91.078 | 100.27 |
| 06/04/2012 | 90.833 | 91.078 | 100.27 |
| 09/04/2012 | 90.783 | 91.078 | 100.325 |
| 10/04/2012 | 88.502 | 88.734 | 100.263 |
| 11/04/2012 | 89.124 | 89.359 | 100.263 |
| 12/04/2012 | 90.048 | 90.29 | 100.269 |
| 13/04/2012 | 88.369 | 88.621 | 100.286 |
| 16/04/2012 | 88.824 | 89.081 | 100.289 |
| 17/04/2012 | 90.787 | 91.061 | 100.301 |
| 18/04/2012 | 89.646 | 89.913 | 100.297 |
| 19/04/2012 | 88.969 | 89.232 | 100.295 |